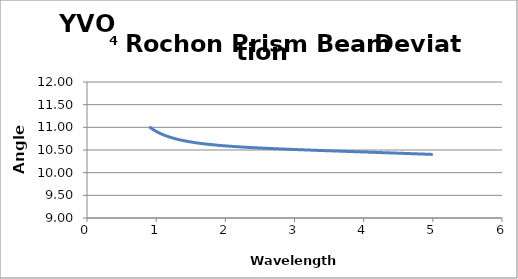
| Category | Series 0 |
|---|---|
| 0.9 | 11.012 |
| 0.901 | 11.011 |
| 0.902 | 11.01 |
| 0.903 | 11.008 |
| 0.904 | 11.007 |
| 0.905 | 11.006 |
| 0.906 | 11.005 |
| 0.907 | 11.004 |
| 0.908 | 11.003 |
| 0.909 | 11.001 |
| 0.91 | 11 |
| 0.911 | 10.999 |
| 0.912 | 10.998 |
| 0.913 | 10.997 |
| 0.914 | 10.996 |
| 0.915 | 10.995 |
| 0.916 | 10.994 |
| 0.917 | 10.992 |
| 0.918 | 10.991 |
| 0.919 | 10.99 |
| 0.92 | 10.989 |
| 0.921 | 10.988 |
| 0.922 | 10.987 |
| 0.923 | 10.986 |
| 0.924 | 10.985 |
| 0.925 | 10.984 |
| 0.926 | 10.982 |
| 0.927 | 10.981 |
| 0.928 | 10.98 |
| 0.929 | 10.979 |
| 0.93 | 10.978 |
| 0.931 | 10.977 |
| 0.932 | 10.976 |
| 0.933 | 10.975 |
| 0.934 | 10.974 |
| 0.935 | 10.973 |
| 0.936 | 10.972 |
| 0.937 | 10.971 |
| 0.938 | 10.97 |
| 0.939 | 10.969 |
| 0.94 | 10.968 |
| 0.941 | 10.967 |
| 0.942 | 10.966 |
| 0.943 | 10.965 |
| 0.944 | 10.964 |
| 0.945 | 10.963 |
| 0.946 | 10.962 |
| 0.947 | 10.961 |
| 0.948 | 10.96 |
| 0.949 | 10.959 |
| 0.95 | 10.958 |
| 0.951 | 10.957 |
| 0.952 | 10.956 |
| 0.953 | 10.955 |
| 0.954 | 10.954 |
| 0.955 | 10.953 |
| 0.956 | 10.952 |
| 0.957 | 10.951 |
| 0.958 | 10.95 |
| 0.959 | 10.949 |
| 0.96 | 10.948 |
| 0.961 | 10.947 |
| 0.962 | 10.946 |
| 0.963 | 10.945 |
| 0.964 | 10.944 |
| 0.965 | 10.943 |
| 0.966 | 10.942 |
| 0.967 | 10.941 |
| 0.968 | 10.94 |
| 0.969 | 10.939 |
| 0.97 | 10.938 |
| 0.971 | 10.937 |
| 0.972 | 10.936 |
| 0.973 | 10.935 |
| 0.974 | 10.935 |
| 0.975 | 10.934 |
| 0.976 | 10.933 |
| 0.977 | 10.932 |
| 0.978 | 10.931 |
| 0.979 | 10.93 |
| 0.98 | 10.929 |
| 0.981 | 10.928 |
| 0.982 | 10.927 |
| 0.983 | 10.926 |
| 0.984 | 10.925 |
| 0.985 | 10.925 |
| 0.986 | 10.924 |
| 0.987 | 10.923 |
| 0.988 | 10.922 |
| 0.989 | 10.921 |
| 0.99 | 10.92 |
| 0.991 | 10.919 |
| 0.992 | 10.918 |
| 0.993 | 10.918 |
| 0.994 | 10.917 |
| 0.995 | 10.916 |
| 0.996 | 10.915 |
| 0.997 | 10.914 |
| 0.998 | 10.913 |
| 0.999 | 10.912 |
| 1.0 | 10.912 |
| 1.001 | 10.911 |
| 1.002 | 10.91 |
| 1.003 | 10.909 |
| 1.004 | 10.908 |
| 1.005 | 10.907 |
| 1.006 | 10.907 |
| 1.007 | 10.906 |
| 1.008 | 10.905 |
| 1.009 | 10.904 |
| 1.01 | 10.903 |
| 1.011 | 10.902 |
| 1.012 | 10.902 |
| 1.013 | 10.901 |
| 1.014 | 10.9 |
| 1.015 | 10.899 |
| 1.016 | 10.898 |
| 1.017 | 10.897 |
| 1.018 | 10.897 |
| 1.019 | 10.896 |
| 1.02 | 10.895 |
| 1.021 | 10.894 |
| 1.022 | 10.893 |
| 1.023 | 10.893 |
| 1.024 | 10.892 |
| 1.025 | 10.891 |
| 1.026 | 10.89 |
| 1.027 | 10.89 |
| 1.028 | 10.889 |
| 1.029 | 10.888 |
| 1.03 | 10.887 |
| 1.031 | 10.886 |
| 1.032 | 10.886 |
| 1.033 | 10.885 |
| 1.034 | 10.884 |
| 1.035 | 10.883 |
| 1.036 | 10.883 |
| 1.037 | 10.882 |
| 1.038 | 10.881 |
| 1.039 | 10.88 |
| 1.04 | 10.88 |
| 1.041 | 10.879 |
| 1.042 | 10.878 |
| 1.043 | 10.877 |
| 1.044 | 10.877 |
| 1.045 | 10.876 |
| 1.046 | 10.875 |
| 1.047 | 10.874 |
| 1.048 | 10.874 |
| 1.049 | 10.873 |
| 1.05 | 10.872 |
| 1.051 | 10.871 |
| 1.052 | 10.871 |
| 1.053 | 10.87 |
| 1.054 | 10.869 |
| 1.055 | 10.869 |
| 1.056 | 10.868 |
| 1.057 | 10.867 |
| 1.058 | 10.866 |
| 1.059 | 10.866 |
| 1.06 | 10.865 |
| 1.061 | 10.864 |
| 1.062 | 10.864 |
| 1.063 | 10.863 |
| 1.064 | 10.862 |
| 1.065 | 10.861 |
| 1.066 | 10.861 |
| 1.067 | 10.86 |
| 1.068 | 10.859 |
| 1.069 | 10.859 |
| 1.07 | 10.858 |
| 1.071 | 10.857 |
| 1.072 | 10.857 |
| 1.073 | 10.856 |
| 1.074 | 10.855 |
| 1.075 | 10.855 |
| 1.076 | 10.854 |
| 1.077 | 10.853 |
| 1.078 | 10.853 |
| 1.079 | 10.852 |
| 1.08 | 10.851 |
| 1.081 | 10.851 |
| 1.082 | 10.85 |
| 1.083 | 10.849 |
| 1.084 | 10.849 |
| 1.085 | 10.848 |
| 1.086 | 10.847 |
| 1.087 | 10.847 |
| 1.088 | 10.846 |
| 1.089 | 10.845 |
| 1.09 | 10.845 |
| 1.091 | 10.844 |
| 1.092 | 10.843 |
| 1.093 | 10.843 |
| 1.094 | 10.842 |
| 1.095 | 10.841 |
| 1.096 | 10.841 |
| 1.097 | 10.84 |
| 1.098 | 10.839 |
| 1.099 | 10.839 |
| 1.1 | 10.838 |
| 1.101 | 10.838 |
| 1.102 | 10.837 |
| 1.103 | 10.836 |
| 1.104 | 10.836 |
| 1.105 | 10.835 |
| 1.106 | 10.834 |
| 1.107 | 10.834 |
| 1.108 | 10.833 |
| 1.109 | 10.833 |
| 1.11 | 10.832 |
| 1.111 | 10.831 |
| 1.112 | 10.831 |
| 1.113 | 10.83 |
| 1.114 | 10.83 |
| 1.115 | 10.829 |
| 1.116 | 10.828 |
| 1.117 | 10.828 |
| 1.118 | 10.827 |
| 1.119 | 10.826 |
| 1.12 | 10.826 |
| 1.121 | 10.825 |
| 1.122 | 10.825 |
| 1.123 | 10.824 |
| 1.124 | 10.823 |
| 1.125 | 10.823 |
| 1.126 | 10.822 |
| 1.127 | 10.822 |
| 1.128 | 10.821 |
| 1.129 | 10.821 |
| 1.13 | 10.82 |
| 1.131 | 10.819 |
| 1.132 | 10.819 |
| 1.133 | 10.818 |
| 1.134 | 10.818 |
| 1.135 | 10.817 |
| 1.136 | 10.816 |
| 1.137 | 10.816 |
| 1.138 | 10.815 |
| 1.139 | 10.815 |
| 1.14 | 10.814 |
| 1.141 | 10.814 |
| 1.142 | 10.813 |
| 1.143 | 10.813 |
| 1.144 | 10.812 |
| 1.145 | 10.811 |
| 1.146 | 10.811 |
| 1.147 | 10.81 |
| 1.148 | 10.81 |
| 1.149 | 10.809 |
| 1.15 | 10.809 |
| 1.151 | 10.808 |
| 1.152 | 10.808 |
| 1.153 | 10.807 |
| 1.154 | 10.806 |
| 1.155 | 10.806 |
| 1.156 | 10.805 |
| 1.157 | 10.805 |
| 1.158 | 10.804 |
| 1.159 | 10.804 |
| 1.16 | 10.803 |
| 1.161 | 10.803 |
| 1.162 | 10.802 |
| 1.163 | 10.802 |
| 1.164 | 10.801 |
| 1.165 | 10.8 |
| 1.166 | 10.8 |
| 1.167 | 10.799 |
| 1.168 | 10.799 |
| 1.169 | 10.798 |
| 1.17 | 10.798 |
| 1.171 | 10.797 |
| 1.172 | 10.797 |
| 1.173 | 10.796 |
| 1.174 | 10.796 |
| 1.175 | 10.795 |
| 1.176 | 10.795 |
| 1.177 | 10.794 |
| 1.178 | 10.794 |
| 1.179 | 10.793 |
| 1.18 | 10.793 |
| 1.181 | 10.792 |
| 1.182 | 10.792 |
| 1.183 | 10.791 |
| 1.184 | 10.791 |
| 1.185 | 10.79 |
| 1.186 | 10.79 |
| 1.187 | 10.789 |
| 1.188 | 10.789 |
| 1.189 | 10.788 |
| 1.19 | 10.788 |
| 1.191 | 10.787 |
| 1.192 | 10.787 |
| 1.193 | 10.786 |
| 1.194 | 10.786 |
| 1.195 | 10.785 |
| 1.196 | 10.785 |
| 1.197 | 10.784 |
| 1.198 | 10.784 |
| 1.199 | 10.783 |
| 1.2 | 10.783 |
| 1.201 | 10.782 |
| 1.202 | 10.782 |
| 1.203 | 10.781 |
| 1.204 | 10.781 |
| 1.205 | 10.78 |
| 1.206 | 10.78 |
| 1.207 | 10.779 |
| 1.208 | 10.779 |
| 1.209 | 10.778 |
| 1.21 | 10.778 |
| 1.211 | 10.777 |
| 1.212 | 10.777 |
| 1.213 | 10.776 |
| 1.214 | 10.776 |
| 1.215 | 10.776 |
| 1.216 | 10.775 |
| 1.217 | 10.775 |
| 1.218 | 10.774 |
| 1.219 | 10.774 |
| 1.22 | 10.773 |
| 1.221 | 10.773 |
| 1.222 | 10.772 |
| 1.223 | 10.772 |
| 1.224 | 10.771 |
| 1.225 | 10.771 |
| 1.226 | 10.77 |
| 1.227 | 10.77 |
| 1.228 | 10.77 |
| 1.229 | 10.769 |
| 1.23 | 10.769 |
| 1.231 | 10.768 |
| 1.232 | 10.768 |
| 1.233 | 10.767 |
| 1.234 | 10.767 |
| 1.235 | 10.766 |
| 1.236 | 10.766 |
| 1.237 | 10.766 |
| 1.238 | 10.765 |
| 1.239 | 10.765 |
| 1.24 | 10.764 |
| 1.241 | 10.764 |
| 1.242 | 10.763 |
| 1.243 | 10.763 |
| 1.244 | 10.762 |
| 1.245 | 10.762 |
| 1.246 | 10.762 |
| 1.247 | 10.761 |
| 1.248 | 10.761 |
| 1.249 | 10.76 |
| 1.25 | 10.76 |
| 1.251 | 10.759 |
| 1.252 | 10.759 |
| 1.253 | 10.759 |
| 1.254 | 10.758 |
| 1.255 | 10.758 |
| 1.256 | 10.757 |
| 1.257 | 10.757 |
| 1.258 | 10.756 |
| 1.259 | 10.756 |
| 1.26 | 10.756 |
| 1.261 | 10.755 |
| 1.262 | 10.755 |
| 1.263 | 10.754 |
| 1.264 | 10.754 |
| 1.265 | 10.754 |
| 1.266 | 10.753 |
| 1.267 | 10.753 |
| 1.268 | 10.752 |
| 1.269 | 10.752 |
| 1.27 | 10.751 |
| 1.271 | 10.751 |
| 1.272 | 10.751 |
| 1.273 | 10.75 |
| 1.274 | 10.75 |
| 1.275 | 10.749 |
| 1.276 | 10.749 |
| 1.277 | 10.749 |
| 1.278 | 10.748 |
| 1.279 | 10.748 |
| 1.28 | 10.747 |
| 1.281 | 10.747 |
| 1.282 | 10.747 |
| 1.283 | 10.746 |
| 1.284 | 10.746 |
| 1.285 | 10.745 |
| 1.286 | 10.745 |
| 1.287 | 10.745 |
| 1.288 | 10.744 |
| 1.289 | 10.744 |
| 1.29 | 10.743 |
| 1.291 | 10.743 |
| 1.292 | 10.743 |
| 1.293 | 10.742 |
| 1.294 | 10.742 |
| 1.295 | 10.742 |
| 1.296 | 10.741 |
| 1.297 | 10.741 |
| 1.298 | 10.74 |
| 1.299 | 10.74 |
| 1.3 | 10.74 |
| 1.301 | 10.739 |
| 1.302 | 10.739 |
| 1.303 | 10.738 |
| 1.304 | 10.738 |
| 1.305 | 10.738 |
| 1.306 | 10.737 |
| 1.307 | 10.737 |
| 1.308 | 10.737 |
| 1.309 | 10.736 |
| 1.31 | 10.736 |
| 1.311 | 10.735 |
| 1.312 | 10.735 |
| 1.313 | 10.735 |
| 1.314 | 10.734 |
| 1.315 | 10.734 |
| 1.316 | 10.734 |
| 1.317 | 10.733 |
| 1.318 | 10.733 |
| 1.319 | 10.732 |
| 1.32 | 10.732 |
| 1.321 | 10.732 |
| 1.322 | 10.731 |
| 1.323 | 10.731 |
| 1.324 | 10.731 |
| 1.325 | 10.73 |
| 1.326 | 10.73 |
| 1.327 | 10.73 |
| 1.328 | 10.729 |
| 1.329 | 10.729 |
| 1.33 | 10.728 |
| 1.331 | 10.728 |
| 1.332 | 10.728 |
| 1.333 | 10.727 |
| 1.334 | 10.727 |
| 1.335 | 10.727 |
| 1.336 | 10.726 |
| 1.337 | 10.726 |
| 1.338 | 10.726 |
| 1.339 | 10.725 |
| 1.34 | 10.725 |
| 1.341 | 10.725 |
| 1.342 | 10.724 |
| 1.343 | 10.724 |
| 1.344 | 10.724 |
| 1.345 | 10.723 |
| 1.346 | 10.723 |
| 1.347 | 10.723 |
| 1.348 | 10.722 |
| 1.349 | 10.722 |
| 1.35 | 10.721 |
| 1.351 | 10.721 |
| 1.352 | 10.721 |
| 1.353 | 10.72 |
| 1.354 | 10.72 |
| 1.355 | 10.72 |
| 1.356 | 10.719 |
| 1.357 | 10.719 |
| 1.358 | 10.719 |
| 1.359 | 10.718 |
| 1.36 | 10.718 |
| 1.361 | 10.718 |
| 1.362 | 10.717 |
| 1.363 | 10.717 |
| 1.364 | 10.717 |
| 1.365 | 10.716 |
| 1.366 | 10.716 |
| 1.367 | 10.716 |
| 1.368 | 10.715 |
| 1.369 | 10.715 |
| 1.37 | 10.715 |
| 1.371 | 10.714 |
| 1.372 | 10.714 |
| 1.373 | 10.714 |
| 1.374 | 10.713 |
| 1.375 | 10.713 |
| 1.376 | 10.713 |
| 1.377 | 10.712 |
| 1.378 | 10.712 |
| 1.379 | 10.712 |
| 1.38 | 10.712 |
| 1.381 | 10.711 |
| 1.382 | 10.711 |
| 1.383 | 10.711 |
| 1.384 | 10.71 |
| 1.385 | 10.71 |
| 1.386 | 10.71 |
| 1.387 | 10.709 |
| 1.388 | 10.709 |
| 1.389 | 10.709 |
| 1.39 | 10.708 |
| 1.391 | 10.708 |
| 1.392 | 10.708 |
| 1.393 | 10.707 |
| 1.394 | 10.707 |
| 1.395 | 10.707 |
| 1.396 | 10.706 |
| 1.397 | 10.706 |
| 1.398 | 10.706 |
| 1.399 | 10.706 |
| 1.4 | 10.705 |
| 1.401 | 10.705 |
| 1.402 | 10.705 |
| 1.403 | 10.704 |
| 1.404 | 10.704 |
| 1.405 | 10.704 |
| 1.406 | 10.703 |
| 1.407 | 10.703 |
| 1.408 | 10.703 |
| 1.409 | 10.702 |
| 1.41 | 10.702 |
| 1.411 | 10.702 |
| 1.412 | 10.702 |
| 1.413 | 10.701 |
| 1.414 | 10.701 |
| 1.415 | 10.701 |
| 1.416 | 10.7 |
| 1.417 | 10.7 |
| 1.418 | 10.7 |
| 1.419 | 10.7 |
| 1.42 | 10.699 |
| 1.421 | 10.699 |
| 1.422 | 10.699 |
| 1.423 | 10.698 |
| 1.424 | 10.698 |
| 1.425 | 10.698 |
| 1.426 | 10.697 |
| 1.427 | 10.697 |
| 1.428 | 10.697 |
| 1.429 | 10.697 |
| 1.43 | 10.696 |
| 1.431 | 10.696 |
| 1.432 | 10.696 |
| 1.433 | 10.695 |
| 1.434 | 10.695 |
| 1.435 | 10.695 |
| 1.436 | 10.695 |
| 1.437 | 10.694 |
| 1.438 | 10.694 |
| 1.439 | 10.694 |
| 1.44 | 10.693 |
| 1.441 | 10.693 |
| 1.442 | 10.693 |
| 1.443 | 10.693 |
| 1.444 | 10.692 |
| 1.445 | 10.692 |
| 1.446 | 10.692 |
| 1.447 | 10.691 |
| 1.448 | 10.691 |
| 1.449 | 10.691 |
| 1.45 | 10.691 |
| 1.451 | 10.69 |
| 1.452 | 10.69 |
| 1.453 | 10.69 |
| 1.454 | 10.689 |
| 1.455 | 10.689 |
| 1.456 | 10.689 |
| 1.457 | 10.689 |
| 1.458 | 10.688 |
| 1.459 | 10.688 |
| 1.46 | 10.688 |
| 1.461 | 10.688 |
| 1.462 | 10.687 |
| 1.463 | 10.687 |
| 1.464 | 10.687 |
| 1.465 | 10.686 |
| 1.466 | 10.686 |
| 1.467 | 10.686 |
| 1.468 | 10.686 |
| 1.469 | 10.685 |
| 1.47 | 10.685 |
| 1.471 | 10.685 |
| 1.472 | 10.685 |
| 1.473 | 10.684 |
| 1.474 | 10.684 |
| 1.475 | 10.684 |
| 1.476 | 10.684 |
| 1.477 | 10.683 |
| 1.478 | 10.683 |
| 1.479 | 10.683 |
| 1.48 | 10.682 |
| 1.481 | 10.682 |
| 1.482 | 10.682 |
| 1.483 | 10.682 |
| 1.484 | 10.681 |
| 1.485 | 10.681 |
| 1.486 | 10.681 |
| 1.487 | 10.681 |
| 1.488 | 10.68 |
| 1.489 | 10.68 |
| 1.49 | 10.68 |
| 1.491 | 10.68 |
| 1.492 | 10.679 |
| 1.493 | 10.679 |
| 1.494 | 10.679 |
| 1.495 | 10.679 |
| 1.496 | 10.678 |
| 1.497 | 10.678 |
| 1.498 | 10.678 |
| 1.499 | 10.678 |
| 1.5 | 10.677 |
| 1.501 | 10.677 |
| 1.502 | 10.677 |
| 1.503 | 10.677 |
| 1.504 | 10.676 |
| 1.505 | 10.676 |
| 1.506 | 10.676 |
| 1.507 | 10.676 |
| 1.508 | 10.675 |
| 1.509 | 10.675 |
| 1.51 | 10.675 |
| 1.511 | 10.675 |
| 1.512 | 10.674 |
| 1.513 | 10.674 |
| 1.514 | 10.674 |
| 1.515 | 10.674 |
| 1.516 | 10.673 |
| 1.517 | 10.673 |
| 1.518 | 10.673 |
| 1.519 | 10.673 |
| 1.52 | 10.672 |
| 1.521 | 10.672 |
| 1.522 | 10.672 |
| 1.523 | 10.672 |
| 1.524 | 10.671 |
| 1.525 | 10.671 |
| 1.526 | 10.671 |
| 1.527 | 10.671 |
| 1.528 | 10.67 |
| 1.529 | 10.67 |
| 1.53 | 10.67 |
| 1.531 | 10.67 |
| 1.532 | 10.669 |
| 1.533 | 10.669 |
| 1.534 | 10.669 |
| 1.535 | 10.669 |
| 1.536 | 10.669 |
| 1.537 | 10.668 |
| 1.538 | 10.668 |
| 1.539 | 10.668 |
| 1.54 | 10.668 |
| 1.541 | 10.667 |
| 1.542 | 10.667 |
| 1.543 | 10.667 |
| 1.544 | 10.667 |
| 1.545 | 10.666 |
| 1.546 | 10.666 |
| 1.547 | 10.666 |
| 1.548 | 10.666 |
| 1.549 | 10.665 |
| 1.55 | 10.665 |
| 1.551 | 10.665 |
| 1.552 | 10.665 |
| 1.553 | 10.665 |
| 1.554 | 10.664 |
| 1.555 | 10.664 |
| 1.556 | 10.664 |
| 1.557 | 10.664 |
| 1.558 | 10.663 |
| 1.559 | 10.663 |
| 1.56 | 10.663 |
| 1.561 | 10.663 |
| 1.562 | 10.663 |
| 1.563 | 10.662 |
| 1.564 | 10.662 |
| 1.565 | 10.662 |
| 1.566 | 10.662 |
| 1.567 | 10.661 |
| 1.568 | 10.661 |
| 1.569 | 10.661 |
| 1.57 | 10.661 |
| 1.571 | 10.66 |
| 1.572 | 10.66 |
| 1.573 | 10.66 |
| 1.574 | 10.66 |
| 1.575 | 10.66 |
| 1.576 | 10.659 |
| 1.577 | 10.659 |
| 1.578 | 10.659 |
| 1.579 | 10.659 |
| 1.58 | 10.659 |
| 1.581 | 10.658 |
| 1.582 | 10.658 |
| 1.583 | 10.658 |
| 1.584 | 10.658 |
| 1.585 | 10.657 |
| 1.586 | 10.657 |
| 1.587 | 10.657 |
| 1.588 | 10.657 |
| 1.589 | 10.657 |
| 1.59 | 10.656 |
| 1.591 | 10.656 |
| 1.592 | 10.656 |
| 1.593 | 10.656 |
| 1.594 | 10.655 |
| 1.595 | 10.655 |
| 1.596 | 10.655 |
| 1.597 | 10.655 |
| 1.598 | 10.655 |
| 1.599 | 10.654 |
| 1.6 | 10.654 |
| 1.601 | 10.654 |
| 1.602 | 10.654 |
| 1.603 | 10.654 |
| 1.604 | 10.653 |
| 1.605 | 10.653 |
| 1.606 | 10.653 |
| 1.607 | 10.653 |
| 1.608 | 10.653 |
| 1.609 | 10.652 |
| 1.61 | 10.652 |
| 1.611 | 10.652 |
| 1.612 | 10.652 |
| 1.613 | 10.651 |
| 1.614 | 10.651 |
| 1.615 | 10.651 |
| 1.616 | 10.651 |
| 1.617 | 10.651 |
| 1.618 | 10.65 |
| 1.619 | 10.65 |
| 1.62 | 10.65 |
| 1.621 | 10.65 |
| 1.622 | 10.65 |
| 1.623 | 10.649 |
| 1.624 | 10.649 |
| 1.625 | 10.649 |
| 1.626 | 10.649 |
| 1.627 | 10.649 |
| 1.628 | 10.648 |
| 1.629 | 10.648 |
| 1.63 | 10.648 |
| 1.631 | 10.648 |
| 1.632 | 10.648 |
| 1.633 | 10.647 |
| 1.634 | 10.647 |
| 1.635 | 10.647 |
| 1.636 | 10.647 |
| 1.637 | 10.647 |
| 1.638 | 10.646 |
| 1.639 | 10.646 |
| 1.64 | 10.646 |
| 1.641 | 10.646 |
| 1.642 | 10.646 |
| 1.643 | 10.645 |
| 1.644 | 10.645 |
| 1.645 | 10.645 |
| 1.646 | 10.645 |
| 1.647 | 10.645 |
| 1.648 | 10.644 |
| 1.649 | 10.644 |
| 1.65 | 10.644 |
| 1.651 | 10.644 |
| 1.652 | 10.644 |
| 1.653 | 10.643 |
| 1.654 | 10.643 |
| 1.655 | 10.643 |
| 1.656 | 10.643 |
| 1.657 | 10.643 |
| 1.658 | 10.643 |
| 1.659 | 10.642 |
| 1.66 | 10.642 |
| 1.661 | 10.642 |
| 1.662 | 10.642 |
| 1.663 | 10.642 |
| 1.664 | 10.641 |
| 1.665 | 10.641 |
| 1.666 | 10.641 |
| 1.667 | 10.641 |
| 1.668 | 10.641 |
| 1.669 | 10.64 |
| 1.67 | 10.64 |
| 1.671 | 10.64 |
| 1.672 | 10.64 |
| 1.673 | 10.64 |
| 1.674 | 10.64 |
| 1.675 | 10.639 |
| 1.676 | 10.639 |
| 1.677 | 10.639 |
| 1.678 | 10.639 |
| 1.679 | 10.639 |
| 1.68 | 10.638 |
| 1.681 | 10.638 |
| 1.682 | 10.638 |
| 1.683 | 10.638 |
| 1.684 | 10.638 |
| 1.685 | 10.637 |
| 1.686 | 10.637 |
| 1.687 | 10.637 |
| 1.688 | 10.637 |
| 1.689 | 10.637 |
| 1.69 | 10.637 |
| 1.691 | 10.636 |
| 1.692 | 10.636 |
| 1.693 | 10.636 |
| 1.694 | 10.636 |
| 1.695 | 10.636 |
| 1.696 | 10.635 |
| 1.697 | 10.635 |
| 1.698 | 10.635 |
| 1.699 | 10.635 |
| 1.7 | 10.635 |
| 1.701 | 10.635 |
| 1.702 | 10.634 |
| 1.703 | 10.634 |
| 1.704 | 10.634 |
| 1.705 | 10.634 |
| 1.706 | 10.634 |
| 1.707 | 10.634 |
| 1.708 | 10.633 |
| 1.709 | 10.633 |
| 1.71 | 10.633 |
| 1.711 | 10.633 |
| 1.712 | 10.633 |
| 1.713 | 10.632 |
| 1.714 | 10.632 |
| 1.715 | 10.632 |
| 1.716 | 10.632 |
| 1.717 | 10.632 |
| 1.718 | 10.632 |
| 1.719 | 10.631 |
| 1.72 | 10.631 |
| 1.721 | 10.631 |
| 1.722 | 10.631 |
| 1.723 | 10.631 |
| 1.724 | 10.631 |
| 1.725 | 10.63 |
| 1.726 | 10.63 |
| 1.727 | 10.63 |
| 1.728 | 10.63 |
| 1.729 | 10.63 |
| 1.73 | 10.629 |
| 1.731 | 10.629 |
| 1.732 | 10.629 |
| 1.733 | 10.629 |
| 1.734 | 10.629 |
| 1.735 | 10.629 |
| 1.736 | 10.628 |
| 1.737 | 10.628 |
| 1.738 | 10.628 |
| 1.739 | 10.628 |
| 1.74 | 10.628 |
| 1.741 | 10.628 |
| 1.742 | 10.627 |
| 1.743 | 10.627 |
| 1.744 | 10.627 |
| 1.745 | 10.627 |
| 1.746 | 10.627 |
| 1.747 | 10.627 |
| 1.748 | 10.626 |
| 1.749 | 10.626 |
| 1.75 | 10.626 |
| 1.751 | 10.626 |
| 1.752 | 10.626 |
| 1.753 | 10.626 |
| 1.754 | 10.625 |
| 1.755 | 10.625 |
| 1.756 | 10.625 |
| 1.757 | 10.625 |
| 1.758 | 10.625 |
| 1.759 | 10.625 |
| 1.76 | 10.624 |
| 1.761 | 10.624 |
| 1.762 | 10.624 |
| 1.763 | 10.624 |
| 1.764 | 10.624 |
| 1.765 | 10.624 |
| 1.766 | 10.623 |
| 1.767 | 10.623 |
| 1.768 | 10.623 |
| 1.769 | 10.623 |
| 1.77 | 10.623 |
| 1.771 | 10.623 |
| 1.772 | 10.623 |
| 1.773 | 10.622 |
| 1.774 | 10.622 |
| 1.775 | 10.622 |
| 1.776 | 10.622 |
| 1.777 | 10.622 |
| 1.778 | 10.622 |
| 1.779 | 10.621 |
| 1.78 | 10.621 |
| 1.781 | 10.621 |
| 1.782 | 10.621 |
| 1.783 | 10.621 |
| 1.784 | 10.621 |
| 1.785 | 10.62 |
| 1.786 | 10.62 |
| 1.787 | 10.62 |
| 1.788 | 10.62 |
| 1.789 | 10.62 |
| 1.79 | 10.62 |
| 1.791 | 10.62 |
| 1.792 | 10.619 |
| 1.793 | 10.619 |
| 1.794 | 10.619 |
| 1.795 | 10.619 |
| 1.796 | 10.619 |
| 1.797 | 10.619 |
| 1.798 | 10.618 |
| 1.799 | 10.618 |
| 1.8 | 10.618 |
| 1.801 | 10.618 |
| 1.802 | 10.618 |
| 1.803 | 10.618 |
| 1.804 | 10.617 |
| 1.805 | 10.617 |
| 1.806 | 10.617 |
| 1.807 | 10.617 |
| 1.808 | 10.617 |
| 1.809 | 10.617 |
| 1.81 | 10.617 |
| 1.811 | 10.616 |
| 1.812 | 10.616 |
| 1.813 | 10.616 |
| 1.814 | 10.616 |
| 1.815 | 10.616 |
| 1.816 | 10.616 |
| 1.817 | 10.616 |
| 1.818 | 10.615 |
| 1.819 | 10.615 |
| 1.82 | 10.615 |
| 1.821 | 10.615 |
| 1.822 | 10.615 |
| 1.823 | 10.615 |
| 1.824 | 10.614 |
| 1.825 | 10.614 |
| 1.826 | 10.614 |
| 1.827 | 10.614 |
| 1.828 | 10.614 |
| 1.829 | 10.614 |
| 1.83 | 10.614 |
| 1.831 | 10.613 |
| 1.832 | 10.613 |
| 1.833 | 10.613 |
| 1.834 | 10.613 |
| 1.835 | 10.613 |
| 1.836 | 10.613 |
| 1.837 | 10.613 |
| 1.838 | 10.612 |
| 1.839 | 10.612 |
| 1.84 | 10.612 |
| 1.841 | 10.612 |
| 1.842 | 10.612 |
| 1.843 | 10.612 |
| 1.844 | 10.612 |
| 1.845 | 10.611 |
| 1.846 | 10.611 |
| 1.847 | 10.611 |
| 1.848 | 10.611 |
| 1.849 | 10.611 |
| 1.85 | 10.611 |
| 1.851 | 10.61 |
| 1.852 | 10.61 |
| 1.853 | 10.61 |
| 1.854 | 10.61 |
| 1.855 | 10.61 |
| 1.856 | 10.61 |
| 1.857 | 10.61 |
| 1.858 | 10.61 |
| 1.859 | 10.609 |
| 1.86 | 10.609 |
| 1.861 | 10.609 |
| 1.862 | 10.609 |
| 1.863 | 10.609 |
| 1.864 | 10.609 |
| 1.865 | 10.609 |
| 1.866 | 10.608 |
| 1.867 | 10.608 |
| 1.868 | 10.608 |
| 1.869 | 10.608 |
| 1.87 | 10.608 |
| 1.871 | 10.608 |
| 1.872 | 10.608 |
| 1.873 | 10.607 |
| 1.874 | 10.607 |
| 1.875 | 10.607 |
| 1.876 | 10.607 |
| 1.877 | 10.607 |
| 1.878 | 10.607 |
| 1.879 | 10.607 |
| 1.88 | 10.606 |
| 1.881 | 10.606 |
| 1.882 | 10.606 |
| 1.883 | 10.606 |
| 1.884 | 10.606 |
| 1.885 | 10.606 |
| 1.886 | 10.606 |
| 1.887 | 10.605 |
| 1.888 | 10.605 |
| 1.889 | 10.605 |
| 1.89 | 10.605 |
| 1.891 | 10.605 |
| 1.892 | 10.605 |
| 1.893 | 10.605 |
| 1.894 | 10.604 |
| 1.895 | 10.604 |
| 1.896 | 10.604 |
| 1.897 | 10.604 |
| 1.898 | 10.604 |
| 1.899 | 10.604 |
| 1.9 | 10.604 |
| 1.901 | 10.604 |
| 1.902 | 10.603 |
| 1.903 | 10.603 |
| 1.904 | 10.603 |
| 1.905 | 10.603 |
| 1.906 | 10.603 |
| 1.907 | 10.603 |
| 1.908 | 10.603 |
| 1.909 | 10.602 |
| 1.91 | 10.602 |
| 1.911 | 10.602 |
| 1.912 | 10.602 |
| 1.913 | 10.602 |
| 1.914 | 10.602 |
| 1.915 | 10.602 |
| 1.916 | 10.602 |
| 1.917 | 10.601 |
| 1.918 | 10.601 |
| 1.919 | 10.601 |
| 1.92 | 10.601 |
| 1.921 | 10.601 |
| 1.922 | 10.601 |
| 1.923 | 10.601 |
| 1.924 | 10.6 |
| 1.925 | 10.6 |
| 1.926 | 10.6 |
| 1.927 | 10.6 |
| 1.928 | 10.6 |
| 1.929 | 10.6 |
| 1.93 | 10.6 |
| 1.931 | 10.6 |
| 1.932 | 10.599 |
| 1.933 | 10.599 |
| 1.934 | 10.599 |
| 1.935 | 10.599 |
| 1.936 | 10.599 |
| 1.937 | 10.599 |
| 1.938 | 10.599 |
| 1.939 | 10.599 |
| 1.94 | 10.598 |
| 1.941 | 10.598 |
| 1.942 | 10.598 |
| 1.943 | 10.598 |
| 1.944 | 10.598 |
| 1.945 | 10.598 |
| 1.946 | 10.598 |
| 1.947 | 10.598 |
| 1.948 | 10.597 |
| 1.949 | 10.597 |
| 1.95 | 10.597 |
| 1.951 | 10.597 |
| 1.952 | 10.597 |
| 1.953 | 10.597 |
| 1.954 | 10.597 |
| 1.955 | 10.597 |
| 1.956 | 10.596 |
| 1.957 | 10.596 |
| 1.958 | 10.596 |
| 1.959 | 10.596 |
| 1.96 | 10.596 |
| 1.961 | 10.596 |
| 1.962 | 10.596 |
| 1.963 | 10.596 |
| 1.964 | 10.595 |
| 1.965 | 10.595 |
| 1.966 | 10.595 |
| 1.967 | 10.595 |
| 1.968 | 10.595 |
| 1.969 | 10.595 |
| 1.97 | 10.595 |
| 1.971 | 10.595 |
| 1.972 | 10.594 |
| 1.973 | 10.594 |
| 1.974 | 10.594 |
| 1.975 | 10.594 |
| 1.976 | 10.594 |
| 1.977 | 10.594 |
| 1.978 | 10.594 |
| 1.979 | 10.594 |
| 1.98 | 10.593 |
| 1.981 | 10.593 |
| 1.982 | 10.593 |
| 1.983 | 10.593 |
| 1.984 | 10.593 |
| 1.985 | 10.593 |
| 1.986 | 10.593 |
| 1.987 | 10.593 |
| 1.988 | 10.592 |
| 1.989 | 10.592 |
| 1.99 | 10.592 |
| 1.991 | 10.592 |
| 1.992 | 10.592 |
| 1.993 | 10.592 |
| 1.994 | 10.592 |
| 1.995 | 10.592 |
| 1.996 | 10.591 |
| 1.997 | 10.591 |
| 1.998 | 10.591 |
| 1.999 | 10.591 |
| 2.0 | 10.591 |
| 2.001 | 10.591 |
| 2.002 | 10.591 |
| 2.003 | 10.591 |
| 2.004 | 10.591 |
| 2.005 | 10.59 |
| 2.006 | 10.59 |
| 2.007 | 10.59 |
| 2.008 | 10.59 |
| 2.009 | 10.59 |
| 2.01 | 10.59 |
| 2.011 | 10.59 |
| 2.012 | 10.59 |
| 2.013 | 10.589 |
| 2.014 | 10.589 |
| 2.015 | 10.589 |
| 2.016 | 10.589 |
| 2.017 | 10.589 |
| 2.018 | 10.589 |
| 2.019 | 10.589 |
| 2.02 | 10.589 |
| 2.021 | 10.589 |
| 2.022 | 10.588 |
| 2.023 | 10.588 |
| 2.024 | 10.588 |
| 2.025 | 10.588 |
| 2.026 | 10.588 |
| 2.027 | 10.588 |
| 2.028 | 10.588 |
| 2.029 | 10.588 |
| 2.03 | 10.588 |
| 2.031 | 10.587 |
| 2.032 | 10.587 |
| 2.033 | 10.587 |
| 2.034 | 10.587 |
| 2.035 | 10.587 |
| 2.036 | 10.587 |
| 2.037 | 10.587 |
| 2.038 | 10.587 |
| 2.039 | 10.586 |
| 2.04 | 10.586 |
| 2.041 | 10.586 |
| 2.042 | 10.586 |
| 2.043 | 10.586 |
| 2.044 | 10.586 |
| 2.045 | 10.586 |
| 2.046 | 10.586 |
| 2.047 | 10.586 |
| 2.048 | 10.585 |
| 2.049 | 10.585 |
| 2.05 | 10.585 |
| 2.051 | 10.585 |
| 2.052 | 10.585 |
| 2.053 | 10.585 |
| 2.054 | 10.585 |
| 2.055 | 10.585 |
| 2.056 | 10.585 |
| 2.057 | 10.584 |
| 2.058 | 10.584 |
| 2.059 | 10.584 |
| 2.06 | 10.584 |
| 2.061 | 10.584 |
| 2.062 | 10.584 |
| 2.063 | 10.584 |
| 2.064 | 10.584 |
| 2.065 | 10.584 |
| 2.066 | 10.583 |
| 2.067 | 10.583 |
| 2.068 | 10.583 |
| 2.069 | 10.583 |
| 2.07 | 10.583 |
| 2.071 | 10.583 |
| 2.072 | 10.583 |
| 2.073 | 10.583 |
| 2.074 | 10.583 |
| 2.075 | 10.582 |
| 2.076 | 10.582 |
| 2.077 | 10.582 |
| 2.078 | 10.582 |
| 2.079 | 10.582 |
| 2.08 | 10.582 |
| 2.081 | 10.582 |
| 2.082 | 10.582 |
| 2.083 | 10.582 |
| 2.084 | 10.581 |
| 2.085 | 10.581 |
| 2.086 | 10.581 |
| 2.087 | 10.581 |
| 2.088 | 10.581 |
| 2.089 | 10.581 |
| 2.09 | 10.581 |
| 2.091 | 10.581 |
| 2.092 | 10.581 |
| 2.093 | 10.58 |
| 2.094 | 10.58 |
| 2.095 | 10.58 |
| 2.096 | 10.58 |
| 2.097 | 10.58 |
| 2.098 | 10.58 |
| 2.099 | 10.58 |
| 2.1 | 10.58 |
| 2.101 | 10.58 |
| 2.102 | 10.58 |
| 2.103 | 10.579 |
| 2.104 | 10.579 |
| 2.105 | 10.579 |
| 2.106 | 10.579 |
| 2.107 | 10.579 |
| 2.108 | 10.579 |
| 2.109 | 10.579 |
| 2.11 | 10.579 |
| 2.111 | 10.579 |
| 2.112 | 10.578 |
| 2.113 | 10.578 |
| 2.114 | 10.578 |
| 2.115 | 10.578 |
| 2.116 | 10.578 |
| 2.117 | 10.578 |
| 2.118 | 10.578 |
| 2.119 | 10.578 |
| 2.12 | 10.578 |
| 2.121 | 10.578 |
| 2.122 | 10.577 |
| 2.123 | 10.577 |
| 2.124 | 10.577 |
| 2.125 | 10.577 |
| 2.126 | 10.577 |
| 2.127 | 10.577 |
| 2.128 | 10.577 |
| 2.129 | 10.577 |
| 2.13 | 10.577 |
| 2.131 | 10.576 |
| 2.132 | 10.576 |
| 2.133 | 10.576 |
| 2.134 | 10.576 |
| 2.135 | 10.576 |
| 2.136 | 10.576 |
| 2.137 | 10.576 |
| 2.138 | 10.576 |
| 2.139 | 10.576 |
| 2.14 | 10.576 |
| 2.141 | 10.575 |
| 2.142 | 10.575 |
| 2.143 | 10.575 |
| 2.144 | 10.575 |
| 2.145 | 10.575 |
| 2.146 | 10.575 |
| 2.147 | 10.575 |
| 2.148 | 10.575 |
| 2.149 | 10.575 |
| 2.15 | 10.575 |
| 2.151 | 10.574 |
| 2.152 | 10.574 |
| 2.153 | 10.574 |
| 2.154 | 10.574 |
| 2.155 | 10.574 |
| 2.156 | 10.574 |
| 2.157 | 10.574 |
| 2.158 | 10.574 |
| 2.159 | 10.574 |
| 2.16 | 10.574 |
| 2.161 | 10.573 |
| 2.162 | 10.573 |
| 2.163 | 10.573 |
| 2.164 | 10.573 |
| 2.165 | 10.573 |
| 2.166 | 10.573 |
| 2.167 | 10.573 |
| 2.168 | 10.573 |
| 2.169 | 10.573 |
| 2.17 | 10.573 |
| 2.171 | 10.572 |
| 2.172 | 10.572 |
| 2.173 | 10.572 |
| 2.174 | 10.572 |
| 2.175 | 10.572 |
| 2.176 | 10.572 |
| 2.177 | 10.572 |
| 2.178 | 10.572 |
| 2.179 | 10.572 |
| 2.18 | 10.572 |
| 2.181 | 10.571 |
| 2.182 | 10.571 |
| 2.183 | 10.571 |
| 2.184 | 10.571 |
| 2.185 | 10.571 |
| 2.186 | 10.571 |
| 2.187 | 10.571 |
| 2.188 | 10.571 |
| 2.189 | 10.571 |
| 2.19 | 10.571 |
| 2.191 | 10.57 |
| 2.192 | 10.57 |
| 2.193 | 10.57 |
| 2.194 | 10.57 |
| 2.195 | 10.57 |
| 2.196 | 10.57 |
| 2.197 | 10.57 |
| 2.198 | 10.57 |
| 2.199 | 10.57 |
| 2.2 | 10.57 |
| 2.201 | 10.57 |
| 2.202 | 10.569 |
| 2.203 | 10.569 |
| 2.204 | 10.569 |
| 2.205 | 10.569 |
| 2.206 | 10.569 |
| 2.207 | 10.569 |
| 2.208 | 10.569 |
| 2.209 | 10.569 |
| 2.21 | 10.569 |
| 2.211 | 10.569 |
| 2.212 | 10.568 |
| 2.213 | 10.568 |
| 2.214 | 10.568 |
| 2.215 | 10.568 |
| 2.216 | 10.568 |
| 2.217 | 10.568 |
| 2.218 | 10.568 |
| 2.219 | 10.568 |
| 2.22 | 10.568 |
| 2.221 | 10.568 |
| 2.222 | 10.568 |
| 2.223 | 10.567 |
| 2.224 | 10.567 |
| 2.225 | 10.567 |
| 2.226 | 10.567 |
| 2.227 | 10.567 |
| 2.228 | 10.567 |
| 2.229 | 10.567 |
| 2.23 | 10.567 |
| 2.231 | 10.567 |
| 2.232 | 10.567 |
| 2.233 | 10.566 |
| 2.234 | 10.566 |
| 2.235 | 10.566 |
| 2.236 | 10.566 |
| 2.237 | 10.566 |
| 2.238 | 10.566 |
| 2.239 | 10.566 |
| 2.24 | 10.566 |
| 2.241 | 10.566 |
| 2.242 | 10.566 |
| 2.243 | 10.566 |
| 2.244 | 10.565 |
| 2.245 | 10.565 |
| 2.246 | 10.565 |
| 2.247 | 10.565 |
| 2.248 | 10.565 |
| 2.249 | 10.565 |
| 2.25 | 10.565 |
| 2.251 | 10.565 |
| 2.252 | 10.565 |
| 2.253 | 10.565 |
| 2.254 | 10.565 |
| 2.255 | 10.564 |
| 2.256 | 10.564 |
| 2.257 | 10.564 |
| 2.258 | 10.564 |
| 2.259 | 10.564 |
| 2.26 | 10.564 |
| 2.261 | 10.564 |
| 2.262 | 10.564 |
| 2.263 | 10.564 |
| 2.264 | 10.564 |
| 2.265 | 10.564 |
| 2.266 | 10.563 |
| 2.267 | 10.563 |
| 2.268 | 10.563 |
| 2.269 | 10.563 |
| 2.27 | 10.563 |
| 2.271 | 10.563 |
| 2.272 | 10.563 |
| 2.273 | 10.563 |
| 2.274 | 10.563 |
| 2.275 | 10.563 |
| 2.276 | 10.563 |
| 2.277 | 10.562 |
| 2.278 | 10.562 |
| 2.279 | 10.562 |
| 2.28 | 10.562 |
| 2.281 | 10.562 |
| 2.282 | 10.562 |
| 2.283 | 10.562 |
| 2.284 | 10.562 |
| 2.285 | 10.562 |
| 2.286 | 10.562 |
| 2.287 | 10.562 |
| 2.288 | 10.561 |
| 2.289 | 10.561 |
| 2.29 | 10.561 |
| 2.291 | 10.561 |
| 2.292 | 10.561 |
| 2.293 | 10.561 |
| 2.294 | 10.561 |
| 2.295 | 10.561 |
| 2.296 | 10.561 |
| 2.297 | 10.561 |
| 2.298 | 10.561 |
| 2.299 | 10.56 |
| 2.3 | 10.56 |
| 2.301 | 10.56 |
| 2.302 | 10.56 |
| 2.303 | 10.56 |
| 2.304 | 10.56 |
| 2.305 | 10.56 |
| 2.306 | 10.56 |
| 2.307 | 10.56 |
| 2.308 | 10.56 |
| 2.309 | 10.56 |
| 2.31 | 10.56 |
| 2.311 | 10.559 |
| 2.312 | 10.559 |
| 2.313 | 10.559 |
| 2.314 | 10.559 |
| 2.315 | 10.559 |
| 2.316 | 10.559 |
| 2.317 | 10.559 |
| 2.318 | 10.559 |
| 2.319 | 10.559 |
| 2.32 | 10.559 |
| 2.321 | 10.559 |
| 2.322 | 10.558 |
| 2.323 | 10.558 |
| 2.324 | 10.558 |
| 2.325 | 10.558 |
| 2.326 | 10.558 |
| 2.327 | 10.558 |
| 2.328 | 10.558 |
| 2.329 | 10.558 |
| 2.33 | 10.558 |
| 2.331 | 10.558 |
| 2.332 | 10.558 |
| 2.333 | 10.558 |
| 2.334 | 10.557 |
| 2.335 | 10.557 |
| 2.336 | 10.557 |
| 2.337 | 10.557 |
| 2.338 | 10.557 |
| 2.339 | 10.557 |
| 2.34 | 10.557 |
| 2.341 | 10.557 |
| 2.342 | 10.557 |
| 2.343 | 10.557 |
| 2.344 | 10.557 |
| 2.345 | 10.557 |
| 2.346 | 10.556 |
| 2.347 | 10.556 |
| 2.348 | 10.556 |
| 2.349 | 10.556 |
| 2.35 | 10.556 |
| 2.351 | 10.556 |
| 2.352 | 10.556 |
| 2.353 | 10.556 |
| 2.354 | 10.556 |
| 2.355 | 10.556 |
| 2.356 | 10.556 |
| 2.357 | 10.555 |
| 2.358 | 10.555 |
| 2.359 | 10.555 |
| 2.36 | 10.555 |
| 2.361 | 10.555 |
| 2.362 | 10.555 |
| 2.363 | 10.555 |
| 2.364 | 10.555 |
| 2.365 | 10.555 |
| 2.366 | 10.555 |
| 2.367 | 10.555 |
| 2.368 | 10.555 |
| 2.369 | 10.554 |
| 2.37 | 10.554 |
| 2.371 | 10.554 |
| 2.372 | 10.554 |
| 2.373 | 10.554 |
| 2.374 | 10.554 |
| 2.375 | 10.554 |
| 2.376 | 10.554 |
| 2.377 | 10.554 |
| 2.378 | 10.554 |
| 2.379 | 10.554 |
| 2.38 | 10.554 |
| 2.381 | 10.554 |
| 2.382 | 10.553 |
| 2.383 | 10.553 |
| 2.384 | 10.553 |
| 2.385 | 10.553 |
| 2.386 | 10.553 |
| 2.387 | 10.553 |
| 2.388 | 10.553 |
| 2.389 | 10.553 |
| 2.39 | 10.553 |
| 2.391 | 10.553 |
| 2.392 | 10.553 |
| 2.393 | 10.553 |
| 2.394 | 10.552 |
| 2.395 | 10.552 |
| 2.396 | 10.552 |
| 2.397 | 10.552 |
| 2.398 | 10.552 |
| 2.399 | 10.552 |
| 2.4 | 10.552 |
| 2.401 | 10.552 |
| 2.402 | 10.552 |
| 2.403 | 10.552 |
| 2.404 | 10.552 |
| 2.405 | 10.552 |
| 2.406 | 10.551 |
| 2.407 | 10.551 |
| 2.408 | 10.551 |
| 2.409 | 10.551 |
| 2.41 | 10.551 |
| 2.411 | 10.551 |
| 2.412 | 10.551 |
| 2.413 | 10.551 |
| 2.414 | 10.551 |
| 2.415 | 10.551 |
| 2.416 | 10.551 |
| 2.417 | 10.551 |
| 2.418 | 10.55 |
| 2.419 | 10.55 |
| 2.42 | 10.55 |
| 2.421 | 10.55 |
| 2.422 | 10.55 |
| 2.423 | 10.55 |
| 2.424 | 10.55 |
| 2.425 | 10.55 |
| 2.426 | 10.55 |
| 2.427 | 10.55 |
| 2.428 | 10.55 |
| 2.429 | 10.55 |
| 2.43 | 10.55 |
| 2.431 | 10.549 |
| 2.432 | 10.549 |
| 2.433 | 10.549 |
| 2.434 | 10.549 |
| 2.435 | 10.549 |
| 2.436 | 10.549 |
| 2.437 | 10.549 |
| 2.438 | 10.549 |
| 2.439 | 10.549 |
| 2.44 | 10.549 |
| 2.441 | 10.549 |
| 2.442 | 10.549 |
| 2.443 | 10.548 |
| 2.444 | 10.548 |
| 2.445 | 10.548 |
| 2.446 | 10.548 |
| 2.447 | 10.548 |
| 2.448 | 10.548 |
| 2.449 | 10.548 |
| 2.45 | 10.548 |
| 2.451 | 10.548 |
| 2.452 | 10.548 |
| 2.453 | 10.548 |
| 2.454 | 10.548 |
| 2.455 | 10.548 |
| 2.456 | 10.547 |
| 2.457 | 10.547 |
| 2.458 | 10.547 |
| 2.459 | 10.547 |
| 2.46 | 10.547 |
| 2.461 | 10.547 |
| 2.462 | 10.547 |
| 2.463 | 10.547 |
| 2.464 | 10.547 |
| 2.465 | 10.547 |
| 2.466 | 10.547 |
| 2.467 | 10.547 |
| 2.468 | 10.547 |
| 2.469 | 10.546 |
| 2.47 | 10.546 |
| 2.471 | 10.546 |
| 2.472 | 10.546 |
| 2.473 | 10.546 |
| 2.474 | 10.546 |
| 2.475 | 10.546 |
| 2.476 | 10.546 |
| 2.477 | 10.546 |
| 2.478 | 10.546 |
| 2.479 | 10.546 |
| 2.48 | 10.546 |
| 2.481 | 10.546 |
| 2.482 | 10.545 |
| 2.483 | 10.545 |
| 2.484 | 10.545 |
| 2.485 | 10.545 |
| 2.486 | 10.545 |
| 2.487 | 10.545 |
| 2.488 | 10.545 |
| 2.489 | 10.545 |
| 2.49 | 10.545 |
| 2.491 | 10.545 |
| 2.492 | 10.545 |
| 2.493 | 10.545 |
| 2.494 | 10.545 |
| 2.495 | 10.544 |
| 2.496 | 10.544 |
| 2.497 | 10.544 |
| 2.498 | 10.544 |
| 2.499 | 10.544 |
| 2.5 | 10.544 |
| 2.501 | 10.544 |
| 2.502 | 10.544 |
| 2.503 | 10.544 |
| 2.504 | 10.544 |
| 2.505 | 10.544 |
| 2.506 | 10.544 |
| 2.507 | 10.544 |
| 2.508 | 10.543 |
| 2.509 | 10.543 |
| 2.51 | 10.543 |
| 2.511 | 10.543 |
| 2.512 | 10.543 |
| 2.513 | 10.543 |
| 2.514 | 10.543 |
| 2.515 | 10.543 |
| 2.516 | 10.543 |
| 2.517 | 10.543 |
| 2.518 | 10.543 |
| 2.519 | 10.543 |
| 2.52 | 10.543 |
| 2.521 | 10.543 |
| 2.522 | 10.542 |
| 2.523 | 10.542 |
| 2.524 | 10.542 |
| 2.525 | 10.542 |
| 2.526 | 10.542 |
| 2.527 | 10.542 |
| 2.528 | 10.542 |
| 2.529 | 10.542 |
| 2.53 | 10.542 |
| 2.531 | 10.542 |
| 2.532 | 10.542 |
| 2.533 | 10.542 |
| 2.534 | 10.542 |
| 2.535 | 10.541 |
| 2.536 | 10.541 |
| 2.537 | 10.541 |
| 2.538 | 10.541 |
| 2.539 | 10.541 |
| 2.54 | 10.541 |
| 2.541 | 10.541 |
| 2.542 | 10.541 |
| 2.543 | 10.541 |
| 2.544 | 10.541 |
| 2.545 | 10.541 |
| 2.546 | 10.541 |
| 2.547 | 10.541 |
| 2.548 | 10.541 |
| 2.549 | 10.54 |
| 2.55 | 10.54 |
| 2.551 | 10.54 |
| 2.552 | 10.54 |
| 2.553 | 10.54 |
| 2.554 | 10.54 |
| 2.555 | 10.54 |
| 2.556 | 10.54 |
| 2.557 | 10.54 |
| 2.558 | 10.54 |
| 2.559 | 10.54 |
| 2.56 | 10.54 |
| 2.561 | 10.54 |
| 2.562 | 10.539 |
| 2.563 | 10.539 |
| 2.564 | 10.539 |
| 2.565 | 10.539 |
| 2.566 | 10.539 |
| 2.567 | 10.539 |
| 2.568 | 10.539 |
| 2.569 | 10.539 |
| 2.57 | 10.539 |
| 2.571 | 10.539 |
| 2.572 | 10.539 |
| 2.573 | 10.539 |
| 2.574 | 10.539 |
| 2.575 | 10.539 |
| 2.576 | 10.538 |
| 2.577 | 10.538 |
| 2.578 | 10.538 |
| 2.579 | 10.538 |
| 2.58 | 10.538 |
| 2.581 | 10.538 |
| 2.582 | 10.538 |
| 2.583 | 10.538 |
| 2.584 | 10.538 |
| 2.585 | 10.538 |
| 2.586 | 10.538 |
| 2.587 | 10.538 |
| 2.588 | 10.538 |
| 2.589 | 10.538 |
| 2.59 | 10.537 |
| 2.591 | 10.537 |
| 2.592 | 10.537 |
| 2.593 | 10.537 |
| 2.594 | 10.537 |
| 2.595 | 10.537 |
| 2.596 | 10.537 |
| 2.597 | 10.537 |
| 2.598 | 10.537 |
| 2.599 | 10.537 |
| 2.6 | 10.537 |
| 2.601 | 10.537 |
| 2.602 | 10.537 |
| 2.603 | 10.537 |
| 2.604 | 10.536 |
| 2.605 | 10.536 |
| 2.606 | 10.536 |
| 2.607 | 10.536 |
| 2.608 | 10.536 |
| 2.609 | 10.536 |
| 2.61 | 10.536 |
| 2.611 | 10.536 |
| 2.612 | 10.536 |
| 2.613 | 10.536 |
| 2.614 | 10.536 |
| 2.615 | 10.536 |
| 2.616 | 10.536 |
| 2.617 | 10.536 |
| 2.618 | 10.535 |
| 2.619 | 10.535 |
| 2.62 | 10.535 |
| 2.621 | 10.535 |
| 2.622 | 10.535 |
| 2.623 | 10.535 |
| 2.624 | 10.535 |
| 2.625 | 10.535 |
| 2.626 | 10.535 |
| 2.627 | 10.535 |
| 2.628 | 10.535 |
| 2.629 | 10.535 |
| 2.63 | 10.535 |
| 2.631 | 10.535 |
| 2.632 | 10.534 |
| 2.633 | 10.534 |
| 2.634 | 10.534 |
| 2.635 | 10.534 |
| 2.636 | 10.534 |
| 2.637 | 10.534 |
| 2.638 | 10.534 |
| 2.639 | 10.534 |
| 2.64 | 10.534 |
| 2.641 | 10.534 |
| 2.642 | 10.534 |
| 2.643 | 10.534 |
| 2.644 | 10.534 |
| 2.645 | 10.534 |
| 2.646 | 10.534 |
| 2.647 | 10.533 |
| 2.648 | 10.533 |
| 2.649 | 10.533 |
| 2.65 | 10.533 |
| 2.651 | 10.533 |
| 2.652 | 10.533 |
| 2.653 | 10.533 |
| 2.654 | 10.533 |
| 2.655 | 10.533 |
| 2.656 | 10.533 |
| 2.657 | 10.533 |
| 2.658 | 10.533 |
| 2.659 | 10.533 |
| 2.66 | 10.533 |
| 2.661 | 10.532 |
| 2.662 | 10.532 |
| 2.663 | 10.532 |
| 2.664 | 10.532 |
| 2.665 | 10.532 |
| 2.666 | 10.532 |
| 2.667 | 10.532 |
| 2.668 | 10.532 |
| 2.669 | 10.532 |
| 2.67 | 10.532 |
| 2.671 | 10.532 |
| 2.672 | 10.532 |
| 2.673 | 10.532 |
| 2.674 | 10.532 |
| 2.675 | 10.532 |
| 2.676 | 10.531 |
| 2.677 | 10.531 |
| 2.678 | 10.531 |
| 2.679 | 10.531 |
| 2.68 | 10.531 |
| 2.681 | 10.531 |
| 2.682 | 10.531 |
| 2.683 | 10.531 |
| 2.684 | 10.531 |
| 2.685 | 10.531 |
| 2.686 | 10.531 |
| 2.687 | 10.531 |
| 2.688 | 10.531 |
| 2.689 | 10.531 |
| 2.69 | 10.531 |
| 2.691 | 10.53 |
| 2.692 | 10.53 |
| 2.693 | 10.53 |
| 2.694 | 10.53 |
| 2.695 | 10.53 |
| 2.696 | 10.53 |
| 2.697 | 10.53 |
| 2.698 | 10.53 |
| 2.699 | 10.53 |
| 2.7 | 10.53 |
| 2.701 | 10.53 |
| 2.702 | 10.53 |
| 2.703 | 10.53 |
| 2.704 | 10.53 |
| 2.705 | 10.53 |
| 2.706 | 10.529 |
| 2.707 | 10.529 |
| 2.708 | 10.529 |
| 2.709 | 10.529 |
| 2.71 | 10.529 |
| 2.711 | 10.529 |
| 2.712 | 10.529 |
| 2.713 | 10.529 |
| 2.714 | 10.529 |
| 2.715 | 10.529 |
| 2.716 | 10.529 |
| 2.717 | 10.529 |
| 2.718 | 10.529 |
| 2.719 | 10.529 |
| 2.72 | 10.528 |
| 2.721 | 10.528 |
| 2.722 | 10.528 |
| 2.723 | 10.528 |
| 2.724 | 10.528 |
| 2.725 | 10.528 |
| 2.726 | 10.528 |
| 2.727 | 10.528 |
| 2.728 | 10.528 |
| 2.729 | 10.528 |
| 2.73 | 10.528 |
| 2.731 | 10.528 |
| 2.732 | 10.528 |
| 2.733 | 10.528 |
| 2.734 | 10.528 |
| 2.735 | 10.528 |
| 2.736 | 10.527 |
| 2.737 | 10.527 |
| 2.738 | 10.527 |
| 2.739 | 10.527 |
| 2.74 | 10.527 |
| 2.741 | 10.527 |
| 2.742 | 10.527 |
| 2.743 | 10.527 |
| 2.744 | 10.527 |
| 2.745 | 10.527 |
| 2.746 | 10.527 |
| 2.747 | 10.527 |
| 2.748 | 10.527 |
| 2.749 | 10.527 |
| 2.75 | 10.527 |
| 2.751 | 10.526 |
| 2.752 | 10.526 |
| 2.753 | 10.526 |
| 2.754 | 10.526 |
| 2.755 | 10.526 |
| 2.756 | 10.526 |
| 2.757 | 10.526 |
| 2.758 | 10.526 |
| 2.759 | 10.526 |
| 2.76 | 10.526 |
| 2.761 | 10.526 |
| 2.762 | 10.526 |
| 2.763 | 10.526 |
| 2.764 | 10.526 |
| 2.765 | 10.526 |
| 2.766 | 10.525 |
| 2.767 | 10.525 |
| 2.768 | 10.525 |
| 2.769 | 10.525 |
| 2.77 | 10.525 |
| 2.771 | 10.525 |
| 2.772 | 10.525 |
| 2.773 | 10.525 |
| 2.774 | 10.525 |
| 2.775 | 10.525 |
| 2.776 | 10.525 |
| 2.777 | 10.525 |
| 2.778 | 10.525 |
| 2.779 | 10.525 |
| 2.78 | 10.525 |
| 2.781 | 10.524 |
| 2.782 | 10.524 |
| 2.783 | 10.524 |
| 2.784 | 10.524 |
| 2.785 | 10.524 |
| 2.786 | 10.524 |
| 2.787 | 10.524 |
| 2.788 | 10.524 |
| 2.789 | 10.524 |
| 2.79 | 10.524 |
| 2.791 | 10.524 |
| 2.792 | 10.524 |
| 2.793 | 10.524 |
| 2.794 | 10.524 |
| 2.795 | 10.524 |
| 2.796 | 10.524 |
| 2.797 | 10.523 |
| 2.798 | 10.523 |
| 2.799 | 10.523 |
| 2.8 | 10.523 |
| 2.801 | 10.523 |
| 2.802 | 10.523 |
| 2.803 | 10.523 |
| 2.804 | 10.523 |
| 2.805 | 10.523 |
| 2.806 | 10.523 |
| 2.807 | 10.523 |
| 2.808 | 10.523 |
| 2.809 | 10.523 |
| 2.81 | 10.523 |
| 2.811 | 10.523 |
| 2.812 | 10.522 |
| 2.813 | 10.522 |
| 2.814 | 10.522 |
| 2.815 | 10.522 |
| 2.816 | 10.522 |
| 2.817 | 10.522 |
| 2.818 | 10.522 |
| 2.819 | 10.522 |
| 2.82 | 10.522 |
| 2.821 | 10.522 |
| 2.822 | 10.522 |
| 2.823 | 10.522 |
| 2.824 | 10.522 |
| 2.825 | 10.522 |
| 2.826 | 10.522 |
| 2.827 | 10.522 |
| 2.828 | 10.521 |
| 2.829 | 10.521 |
| 2.83 | 10.521 |
| 2.831 | 10.521 |
| 2.832 | 10.521 |
| 2.833 | 10.521 |
| 2.834 | 10.521 |
| 2.835 | 10.521 |
| 2.836 | 10.521 |
| 2.837 | 10.521 |
| 2.838 | 10.521 |
| 2.839 | 10.521 |
| 2.84 | 10.521 |
| 2.841 | 10.521 |
| 2.842 | 10.521 |
| 2.843 | 10.521 |
| 2.844 | 10.52 |
| 2.845 | 10.52 |
| 2.846 | 10.52 |
| 2.847 | 10.52 |
| 2.848 | 10.52 |
| 2.849 | 10.52 |
| 2.85 | 10.52 |
| 2.851 | 10.52 |
| 2.852 | 10.52 |
| 2.853 | 10.52 |
| 2.854 | 10.52 |
| 2.855 | 10.52 |
| 2.856 | 10.52 |
| 2.857 | 10.52 |
| 2.858 | 10.52 |
| 2.859 | 10.52 |
| 2.86 | 10.519 |
| 2.861 | 10.519 |
| 2.862 | 10.519 |
| 2.863 | 10.519 |
| 2.864 | 10.519 |
| 2.865 | 10.519 |
| 2.866 | 10.519 |
| 2.867 | 10.519 |
| 2.868 | 10.519 |
| 2.869 | 10.519 |
| 2.87 | 10.519 |
| 2.871 | 10.519 |
| 2.872 | 10.519 |
| 2.873 | 10.519 |
| 2.874 | 10.519 |
| 2.875 | 10.519 |
| 2.876 | 10.518 |
| 2.877 | 10.518 |
| 2.878 | 10.518 |
| 2.879 | 10.518 |
| 2.88 | 10.518 |
| 2.881 | 10.518 |
| 2.882 | 10.518 |
| 2.883 | 10.518 |
| 2.884 | 10.518 |
| 2.885 | 10.518 |
| 2.886 | 10.518 |
| 2.887 | 10.518 |
| 2.888 | 10.518 |
| 2.889 | 10.518 |
| 2.89 | 10.518 |
| 2.891 | 10.518 |
| 2.892 | 10.517 |
| 2.893 | 10.517 |
| 2.894 | 10.517 |
| 2.895 | 10.517 |
| 2.896 | 10.517 |
| 2.897 | 10.517 |
| 2.898 | 10.517 |
| 2.899 | 10.517 |
| 2.9 | 10.517 |
| 2.901 | 10.517 |
| 2.902 | 10.517 |
| 2.903 | 10.517 |
| 2.904 | 10.517 |
| 2.905 | 10.517 |
| 2.906 | 10.517 |
| 2.907 | 10.517 |
| 2.908 | 10.516 |
| 2.909 | 10.516 |
| 2.91 | 10.516 |
| 2.911 | 10.516 |
| 2.912 | 10.516 |
| 2.913 | 10.516 |
| 2.914 | 10.516 |
| 2.915 | 10.516 |
| 2.916 | 10.516 |
| 2.917 | 10.516 |
| 2.918 | 10.516 |
| 2.919 | 10.516 |
| 2.92 | 10.516 |
| 2.921 | 10.516 |
| 2.922 | 10.516 |
| 2.923 | 10.516 |
| 2.924 | 10.516 |
| 2.925 | 10.515 |
| 2.926 | 10.515 |
| 2.927 | 10.515 |
| 2.928 | 10.515 |
| 2.929 | 10.515 |
| 2.93 | 10.515 |
| 2.931 | 10.515 |
| 2.932 | 10.515 |
| 2.933 | 10.515 |
| 2.934 | 10.515 |
| 2.935 | 10.515 |
| 2.936 | 10.515 |
| 2.937 | 10.515 |
| 2.938 | 10.515 |
| 2.939 | 10.515 |
| 2.94 | 10.515 |
| 2.941 | 10.514 |
| 2.942 | 10.514 |
| 2.943 | 10.514 |
| 2.944 | 10.514 |
| 2.945 | 10.514 |
| 2.946 | 10.514 |
| 2.947 | 10.514 |
| 2.948 | 10.514 |
| 2.949 | 10.514 |
| 2.95 | 10.514 |
| 2.951 | 10.514 |
| 2.952 | 10.514 |
| 2.953 | 10.514 |
| 2.954 | 10.514 |
| 2.955 | 10.514 |
| 2.956 | 10.514 |
| 2.957 | 10.513 |
| 2.958 | 10.513 |
| 2.959 | 10.513 |
| 2.96 | 10.513 |
| 2.961 | 10.513 |
| 2.962 | 10.513 |
| 2.963 | 10.513 |
| 2.964 | 10.513 |
| 2.965 | 10.513 |
| 2.966 | 10.513 |
| 2.967 | 10.513 |
| 2.968 | 10.513 |
| 2.969 | 10.513 |
| 2.97 | 10.513 |
| 2.971 | 10.513 |
| 2.972 | 10.513 |
| 2.973 | 10.513 |
| 2.974 | 10.512 |
| 2.975 | 10.512 |
| 2.976 | 10.512 |
| 2.977 | 10.512 |
| 2.978 | 10.512 |
| 2.979 | 10.512 |
| 2.98 | 10.512 |
| 2.981 | 10.512 |
| 2.982 | 10.512 |
| 2.983 | 10.512 |
| 2.984 | 10.512 |
| 2.985 | 10.512 |
| 2.986 | 10.512 |
| 2.987 | 10.512 |
| 2.988 | 10.512 |
| 2.989 | 10.512 |
| 2.99 | 10.512 |
| 2.991 | 10.511 |
| 2.992 | 10.511 |
| 2.993 | 10.511 |
| 2.994 | 10.511 |
| 2.995 | 10.511 |
| 2.996 | 10.511 |
| 2.997 | 10.511 |
| 2.998 | 10.511 |
| 2.999 | 10.511 |
| 3.0 | 10.511 |
| 3.001 | 10.511 |
| 3.002 | 10.511 |
| 3.003 | 10.511 |
| 3.004 | 10.511 |
| 3.005 | 10.511 |
| 3.006 | 10.511 |
| 3.007 | 10.51 |
| 3.008 | 10.51 |
| 3.009 | 10.51 |
| 3.01 | 10.51 |
| 3.011 | 10.51 |
| 3.012 | 10.51 |
| 3.013 | 10.51 |
| 3.014 | 10.51 |
| 3.015 | 10.51 |
| 3.016 | 10.51 |
| 3.017 | 10.51 |
| 3.018 | 10.51 |
| 3.019 | 10.51 |
| 3.02 | 10.51 |
| 3.021 | 10.51 |
| 3.022 | 10.51 |
| 3.023 | 10.51 |
| 3.024 | 10.509 |
| 3.025 | 10.509 |
| 3.026 | 10.509 |
| 3.027 | 10.509 |
| 3.028 | 10.509 |
| 3.029 | 10.509 |
| 3.03 | 10.509 |
| 3.031 | 10.509 |
| 3.032 | 10.509 |
| 3.033 | 10.509 |
| 3.034 | 10.509 |
| 3.035 | 10.509 |
| 3.036 | 10.509 |
| 3.037 | 10.509 |
| 3.038 | 10.509 |
| 3.039 | 10.509 |
| 3.04 | 10.509 |
| 3.041 | 10.508 |
| 3.042 | 10.508 |
| 3.043 | 10.508 |
| 3.044 | 10.508 |
| 3.045 | 10.508 |
| 3.046 | 10.508 |
| 3.047 | 10.508 |
| 3.048 | 10.508 |
| 3.049 | 10.508 |
| 3.05 | 10.508 |
| 3.051 | 10.508 |
| 3.052 | 10.508 |
| 3.053 | 10.508 |
| 3.054 | 10.508 |
| 3.055 | 10.508 |
| 3.056 | 10.508 |
| 3.057 | 10.508 |
| 3.058 | 10.507 |
| 3.059 | 10.507 |
| 3.06 | 10.507 |
| 3.061 | 10.507 |
| 3.062 | 10.507 |
| 3.063 | 10.507 |
| 3.064 | 10.507 |
| 3.065 | 10.507 |
| 3.066 | 10.507 |
| 3.067 | 10.507 |
| 3.068 | 10.507 |
| 3.069 | 10.507 |
| 3.07 | 10.507 |
| 3.071 | 10.507 |
| 3.072 | 10.507 |
| 3.073 | 10.507 |
| 3.074 | 10.507 |
| 3.075 | 10.506 |
| 3.076 | 10.506 |
| 3.077 | 10.506 |
| 3.078 | 10.506 |
| 3.079 | 10.506 |
| 3.08 | 10.506 |
| 3.081 | 10.506 |
| 3.082 | 10.506 |
| 3.083 | 10.506 |
| 3.084 | 10.506 |
| 3.085 | 10.506 |
| 3.086 | 10.506 |
| 3.087 | 10.506 |
| 3.088 | 10.506 |
| 3.089 | 10.506 |
| 3.09 | 10.506 |
| 3.091 | 10.506 |
| 3.092 | 10.506 |
| 3.093 | 10.505 |
| 3.094 | 10.505 |
| 3.095 | 10.505 |
| 3.096 | 10.505 |
| 3.097 | 10.505 |
| 3.098 | 10.505 |
| 3.099 | 10.505 |
| 3.1 | 10.505 |
| 3.101 | 10.505 |
| 3.102 | 10.505 |
| 3.103 | 10.505 |
| 3.104 | 10.505 |
| 3.105 | 10.505 |
| 3.106 | 10.505 |
| 3.107 | 10.505 |
| 3.108 | 10.505 |
| 3.109 | 10.505 |
| 3.11 | 10.504 |
| 3.111 | 10.504 |
| 3.112 | 10.504 |
| 3.113 | 10.504 |
| 3.114 | 10.504 |
| 3.115 | 10.504 |
| 3.116 | 10.504 |
| 3.117 | 10.504 |
| 3.118 | 10.504 |
| 3.119 | 10.504 |
| 3.12 | 10.504 |
| 3.121 | 10.504 |
| 3.122 | 10.504 |
| 3.123 | 10.504 |
| 3.124 | 10.504 |
| 3.125 | 10.504 |
| 3.126 | 10.504 |
| 3.127 | 10.503 |
| 3.128 | 10.503 |
| 3.129 | 10.503 |
| 3.13 | 10.503 |
| 3.131 | 10.503 |
| 3.132 | 10.503 |
| 3.133 | 10.503 |
| 3.134 | 10.503 |
| 3.135 | 10.503 |
| 3.136 | 10.503 |
| 3.137 | 10.503 |
| 3.138 | 10.503 |
| 3.139 | 10.503 |
| 3.14 | 10.503 |
| 3.141 | 10.503 |
| 3.142 | 10.503 |
| 3.143 | 10.503 |
| 3.144 | 10.503 |
| 3.145 | 10.502 |
| 3.146 | 10.502 |
| 3.147 | 10.502 |
| 3.148 | 10.502 |
| 3.149 | 10.502 |
| 3.15 | 10.502 |
| 3.151 | 10.502 |
| 3.152 | 10.502 |
| 3.153 | 10.502 |
| 3.154 | 10.502 |
| 3.155 | 10.502 |
| 3.156 | 10.502 |
| 3.157 | 10.502 |
| 3.158 | 10.502 |
| 3.159 | 10.502 |
| 3.16 | 10.502 |
| 3.161 | 10.502 |
| 3.162 | 10.501 |
| 3.163 | 10.501 |
| 3.164 | 10.501 |
| 3.165 | 10.501 |
| 3.166 | 10.501 |
| 3.167 | 10.501 |
| 3.168 | 10.501 |
| 3.169 | 10.501 |
| 3.17 | 10.501 |
| 3.171 | 10.501 |
| 3.172 | 10.501 |
| 3.173 | 10.501 |
| 3.174 | 10.501 |
| 3.175 | 10.501 |
| 3.176 | 10.501 |
| 3.177 | 10.501 |
| 3.178 | 10.501 |
| 3.179 | 10.501 |
| 3.18 | 10.5 |
| 3.181 | 10.5 |
| 3.182 | 10.5 |
| 3.183 | 10.5 |
| 3.184 | 10.5 |
| 3.185 | 10.5 |
| 3.186 | 10.5 |
| 3.187 | 10.5 |
| 3.188 | 10.5 |
| 3.189 | 10.5 |
| 3.19 | 10.5 |
| 3.191 | 10.5 |
| 3.192 | 10.5 |
| 3.193 | 10.5 |
| 3.194 | 10.5 |
| 3.195 | 10.5 |
| 3.196 | 10.5 |
| 3.197 | 10.5 |
| 3.198 | 10.499 |
| 3.199 | 10.499 |
| 3.2 | 10.499 |
| 3.201 | 10.499 |
| 3.202 | 10.499 |
| 3.203 | 10.499 |
| 3.204 | 10.499 |
| 3.205 | 10.499 |
| 3.206 | 10.499 |
| 3.207 | 10.499 |
| 3.208 | 10.499 |
| 3.209 | 10.499 |
| 3.21 | 10.499 |
| 3.211 | 10.499 |
| 3.212 | 10.499 |
| 3.213 | 10.499 |
| 3.214 | 10.499 |
| 3.215 | 10.498 |
| 3.216 | 10.498 |
| 3.217 | 10.498 |
| 3.218 | 10.498 |
| 3.219 | 10.498 |
| 3.22 | 10.498 |
| 3.221 | 10.498 |
| 3.222 | 10.498 |
| 3.223 | 10.498 |
| 3.224 | 10.498 |
| 3.225 | 10.498 |
| 3.226 | 10.498 |
| 3.227 | 10.498 |
| 3.228 | 10.498 |
| 3.229 | 10.498 |
| 3.23 | 10.498 |
| 3.231 | 10.498 |
| 3.232 | 10.498 |
| 3.233 | 10.497 |
| 3.234 | 10.497 |
| 3.235 | 10.497 |
| 3.236 | 10.497 |
| 3.237 | 10.497 |
| 3.238 | 10.497 |
| 3.239 | 10.497 |
| 3.24 | 10.497 |
| 3.241 | 10.497 |
| 3.242 | 10.497 |
| 3.243 | 10.497 |
| 3.244 | 10.497 |
| 3.245 | 10.497 |
| 3.246 | 10.497 |
| 3.247 | 10.497 |
| 3.248 | 10.497 |
| 3.249 | 10.497 |
| 3.25 | 10.497 |
| 3.251 | 10.496 |
| 3.252 | 10.496 |
| 3.253 | 10.496 |
| 3.254 | 10.496 |
| 3.255 | 10.496 |
| 3.256 | 10.496 |
| 3.257 | 10.496 |
| 3.258 | 10.496 |
| 3.259 | 10.496 |
| 3.26 | 10.496 |
| 3.261 | 10.496 |
| 3.262 | 10.496 |
| 3.263 | 10.496 |
| 3.264 | 10.496 |
| 3.265 | 10.496 |
| 3.266 | 10.496 |
| 3.267 | 10.496 |
| 3.268 | 10.496 |
| 3.269 | 10.495 |
| 3.27 | 10.495 |
| 3.271 | 10.495 |
| 3.272 | 10.495 |
| 3.273 | 10.495 |
| 3.274 | 10.495 |
| 3.275 | 10.495 |
| 3.276 | 10.495 |
| 3.277 | 10.495 |
| 3.278 | 10.495 |
| 3.279 | 10.495 |
| 3.28 | 10.495 |
| 3.281 | 10.495 |
| 3.282 | 10.495 |
| 3.283 | 10.495 |
| 3.284 | 10.495 |
| 3.285 | 10.495 |
| 3.286 | 10.495 |
| 3.287 | 10.494 |
| 3.288 | 10.494 |
| 3.289 | 10.494 |
| 3.29 | 10.494 |
| 3.291 | 10.494 |
| 3.292 | 10.494 |
| 3.293 | 10.494 |
| 3.294 | 10.494 |
| 3.295 | 10.494 |
| 3.296 | 10.494 |
| 3.297 | 10.494 |
| 3.298 | 10.494 |
| 3.299 | 10.494 |
| 3.3 | 10.494 |
| 3.301 | 10.494 |
| 3.302 | 10.494 |
| 3.303 | 10.494 |
| 3.304 | 10.494 |
| 3.305 | 10.493 |
| 3.306 | 10.493 |
| 3.307 | 10.493 |
| 3.308 | 10.493 |
| 3.309 | 10.493 |
| 3.31 | 10.493 |
| 3.311 | 10.493 |
| 3.312 | 10.493 |
| 3.313 | 10.493 |
| 3.314 | 10.493 |
| 3.315 | 10.493 |
| 3.316 | 10.493 |
| 3.317 | 10.493 |
| 3.318 | 10.493 |
| 3.319 | 10.493 |
| 3.32 | 10.493 |
| 3.321 | 10.493 |
| 3.322 | 10.493 |
| 3.323 | 10.492 |
| 3.324 | 10.492 |
| 3.325 | 10.492 |
| 3.326 | 10.492 |
| 3.327 | 10.492 |
| 3.328 | 10.492 |
| 3.329 | 10.492 |
| 3.33 | 10.492 |
| 3.331 | 10.492 |
| 3.332 | 10.492 |
| 3.333 | 10.492 |
| 3.334 | 10.492 |
| 3.335 | 10.492 |
| 3.336 | 10.492 |
| 3.337 | 10.492 |
| 3.338 | 10.492 |
| 3.339 | 10.492 |
| 3.34 | 10.492 |
| 3.341 | 10.491 |
| 3.342 | 10.491 |
| 3.343 | 10.491 |
| 3.344 | 10.491 |
| 3.345 | 10.491 |
| 3.346 | 10.491 |
| 3.347 | 10.491 |
| 3.348 | 10.491 |
| 3.349 | 10.491 |
| 3.35 | 10.491 |
| 3.351 | 10.491 |
| 3.352 | 10.491 |
| 3.353 | 10.491 |
| 3.354 | 10.491 |
| 3.355 | 10.491 |
| 3.356 | 10.491 |
| 3.357 | 10.491 |
| 3.358 | 10.491 |
| 3.359 | 10.49 |
| 3.36 | 10.49 |
| 3.361 | 10.49 |
| 3.362 | 10.49 |
| 3.363 | 10.49 |
| 3.364 | 10.49 |
| 3.365 | 10.49 |
| 3.366 | 10.49 |
| 3.367 | 10.49 |
| 3.368 | 10.49 |
| 3.369 | 10.49 |
| 3.37 | 10.49 |
| 3.371 | 10.49 |
| 3.372 | 10.49 |
| 3.373 | 10.49 |
| 3.374 | 10.49 |
| 3.375 | 10.49 |
| 3.376 | 10.49 |
| 3.377 | 10.49 |
| 3.378 | 10.489 |
| 3.379 | 10.489 |
| 3.38 | 10.489 |
| 3.381 | 10.489 |
| 3.382 | 10.489 |
| 3.383 | 10.489 |
| 3.384 | 10.489 |
| 3.385 | 10.489 |
| 3.386 | 10.489 |
| 3.387 | 10.489 |
| 3.388 | 10.489 |
| 3.389 | 10.489 |
| 3.39 | 10.489 |
| 3.391 | 10.489 |
| 3.392 | 10.489 |
| 3.393 | 10.489 |
| 3.394 | 10.489 |
| 3.395 | 10.489 |
| 3.396 | 10.488 |
| 3.397 | 10.488 |
| 3.398 | 10.488 |
| 3.399 | 10.488 |
| 3.4 | 10.488 |
| 3.401 | 10.488 |
| 3.402 | 10.488 |
| 3.403 | 10.488 |
| 3.404 | 10.488 |
| 3.405 | 10.488 |
| 3.406 | 10.488 |
| 3.407 | 10.488 |
| 3.408 | 10.488 |
| 3.409 | 10.488 |
| 3.41 | 10.488 |
| 3.411 | 10.488 |
| 3.412 | 10.488 |
| 3.413 | 10.488 |
| 3.414 | 10.488 |
| 3.415 | 10.487 |
| 3.416 | 10.487 |
| 3.417 | 10.487 |
| 3.418 | 10.487 |
| 3.419 | 10.487 |
| 3.42 | 10.487 |
| 3.421 | 10.487 |
| 3.422 | 10.487 |
| 3.423 | 10.487 |
| 3.424 | 10.487 |
| 3.425 | 10.487 |
| 3.426 | 10.487 |
| 3.427 | 10.487 |
| 3.428 | 10.487 |
| 3.429 | 10.487 |
| 3.43 | 10.487 |
| 3.431 | 10.487 |
| 3.432 | 10.487 |
| 3.433 | 10.486 |
| 3.434 | 10.486 |
| 3.435 | 10.486 |
| 3.436 | 10.486 |
| 3.437 | 10.486 |
| 3.438 | 10.486 |
| 3.439 | 10.486 |
| 3.44 | 10.486 |
| 3.441 | 10.486 |
| 3.442 | 10.486 |
| 3.443 | 10.486 |
| 3.444 | 10.486 |
| 3.445 | 10.486 |
| 3.446 | 10.486 |
| 3.447 | 10.486 |
| 3.448 | 10.486 |
| 3.449 | 10.486 |
| 3.45 | 10.486 |
| 3.451 | 10.485 |
| 3.452 | 10.485 |
| 3.453 | 10.485 |
| 3.454 | 10.485 |
| 3.455 | 10.485 |
| 3.456 | 10.485 |
| 3.457 | 10.485 |
| 3.458 | 10.485 |
| 3.459 | 10.485 |
| 3.46 | 10.485 |
| 3.461 | 10.485 |
| 3.462 | 10.485 |
| 3.463 | 10.485 |
| 3.464 | 10.485 |
| 3.465 | 10.485 |
| 3.466 | 10.485 |
| 3.467 | 10.485 |
| 3.468 | 10.485 |
| 3.469 | 10.485 |
| 3.47 | 10.484 |
| 3.471 | 10.484 |
| 3.472 | 10.484 |
| 3.473 | 10.484 |
| 3.474 | 10.484 |
| 3.475 | 10.484 |
| 3.476 | 10.484 |
| 3.477 | 10.484 |
| 3.478 | 10.484 |
| 3.479 | 10.484 |
| 3.48 | 10.484 |
| 3.481 | 10.484 |
| 3.482 | 10.484 |
| 3.483 | 10.484 |
| 3.484 | 10.484 |
| 3.485 | 10.484 |
| 3.486 | 10.484 |
| 3.487 | 10.484 |
| 3.488 | 10.483 |
| 3.489 | 10.483 |
| 3.49 | 10.483 |
| 3.491 | 10.483 |
| 3.492 | 10.483 |
| 3.493 | 10.483 |
| 3.494 | 10.483 |
| 3.495 | 10.483 |
| 3.496 | 10.483 |
| 3.497 | 10.483 |
| 3.498 | 10.483 |
| 3.499 | 10.483 |
| 3.5 | 10.483 |
| 3.501 | 10.483 |
| 3.502 | 10.483 |
| 3.503 | 10.483 |
| 3.504 | 10.483 |
| 3.505 | 10.483 |
| 3.506 | 10.483 |
| 3.507 | 10.482 |
| 3.508 | 10.482 |
| 3.509 | 10.482 |
| 3.51 | 10.482 |
| 3.511 | 10.482 |
| 3.512 | 10.482 |
| 3.513 | 10.482 |
| 3.514 | 10.482 |
| 3.515 | 10.482 |
| 3.516 | 10.482 |
| 3.517 | 10.482 |
| 3.518 | 10.482 |
| 3.519 | 10.482 |
| 3.52 | 10.482 |
| 3.521 | 10.482 |
| 3.522 | 10.482 |
| 3.523 | 10.482 |
| 3.524 | 10.482 |
| 3.525 | 10.482 |
| 3.526 | 10.481 |
| 3.527 | 10.481 |
| 3.528 | 10.481 |
| 3.529 | 10.481 |
| 3.53 | 10.481 |
| 3.531 | 10.481 |
| 3.532 | 10.481 |
| 3.533 | 10.481 |
| 3.534 | 10.481 |
| 3.535 | 10.481 |
| 3.536 | 10.481 |
| 3.537 | 10.481 |
| 3.538 | 10.481 |
| 3.539 | 10.481 |
| 3.54 | 10.481 |
| 3.541 | 10.481 |
| 3.542 | 10.481 |
| 3.543 | 10.481 |
| 3.544 | 10.48 |
| 3.545 | 10.48 |
| 3.546 | 10.48 |
| 3.547 | 10.48 |
| 3.548 | 10.48 |
| 3.549 | 10.48 |
| 3.55 | 10.48 |
| 3.551 | 10.48 |
| 3.552 | 10.48 |
| 3.553 | 10.48 |
| 3.554 | 10.48 |
| 3.555 | 10.48 |
| 3.556 | 10.48 |
| 3.557 | 10.48 |
| 3.558 | 10.48 |
| 3.559 | 10.48 |
| 3.56 | 10.48 |
| 3.561 | 10.48 |
| 3.562 | 10.48 |
| 3.563 | 10.479 |
| 3.564 | 10.479 |
| 3.565 | 10.479 |
| 3.566 | 10.479 |
| 3.567 | 10.479 |
| 3.568 | 10.479 |
| 3.569 | 10.479 |
| 3.57 | 10.479 |
| 3.571 | 10.479 |
| 3.572 | 10.479 |
| 3.573 | 10.479 |
| 3.574 | 10.479 |
| 3.575 | 10.479 |
| 3.576 | 10.479 |
| 3.577 | 10.479 |
| 3.578 | 10.479 |
| 3.579 | 10.479 |
| 3.58 | 10.479 |
| 3.581 | 10.479 |
| 3.582 | 10.478 |
| 3.583 | 10.478 |
| 3.584 | 10.478 |
| 3.585 | 10.478 |
| 3.586 | 10.478 |
| 3.587 | 10.478 |
| 3.588 | 10.478 |
| 3.589 | 10.478 |
| 3.59 | 10.478 |
| 3.591 | 10.478 |
| 3.592 | 10.478 |
| 3.593 | 10.478 |
| 3.594 | 10.478 |
| 3.595 | 10.478 |
| 3.596 | 10.478 |
| 3.597 | 10.478 |
| 3.598 | 10.478 |
| 3.599 | 10.478 |
| 3.6 | 10.477 |
| 3.601 | 10.477 |
| 3.602 | 10.477 |
| 3.603 | 10.477 |
| 3.604 | 10.477 |
| 3.605 | 10.477 |
| 3.606 | 10.477 |
| 3.607 | 10.477 |
| 3.608 | 10.477 |
| 3.609 | 10.477 |
| 3.61 | 10.477 |
| 3.611 | 10.477 |
| 3.612 | 10.477 |
| 3.613 | 10.477 |
| 3.614 | 10.477 |
| 3.615 | 10.477 |
| 3.616 | 10.477 |
| 3.617 | 10.477 |
| 3.618 | 10.477 |
| 3.619 | 10.476 |
| 3.62 | 10.476 |
| 3.621 | 10.476 |
| 3.622 | 10.476 |
| 3.623 | 10.476 |
| 3.624 | 10.476 |
| 3.625 | 10.476 |
| 3.626 | 10.476 |
| 3.627 | 10.476 |
| 3.628 | 10.476 |
| 3.629 | 10.476 |
| 3.63 | 10.476 |
| 3.631 | 10.476 |
| 3.632 | 10.476 |
| 3.633 | 10.476 |
| 3.634 | 10.476 |
| 3.635 | 10.476 |
| 3.636 | 10.476 |
| 3.637 | 10.476 |
| 3.638 | 10.475 |
| 3.639 | 10.475 |
| 3.64 | 10.475 |
| 3.641 | 10.475 |
| 3.642 | 10.475 |
| 3.643 | 10.475 |
| 3.644 | 10.475 |
| 3.645 | 10.475 |
| 3.646 | 10.475 |
| 3.647 | 10.475 |
| 3.648 | 10.475 |
| 3.649 | 10.475 |
| 3.65 | 10.475 |
| 3.651 | 10.475 |
| 3.652 | 10.475 |
| 3.653 | 10.475 |
| 3.654 | 10.475 |
| 3.655 | 10.475 |
| 3.656 | 10.475 |
| 3.657 | 10.474 |
| 3.658 | 10.474 |
| 3.659 | 10.474 |
| 3.66 | 10.474 |
| 3.661 | 10.474 |
| 3.662 | 10.474 |
| 3.663 | 10.474 |
| 3.664 | 10.474 |
| 3.665 | 10.474 |
| 3.666 | 10.474 |
| 3.667 | 10.474 |
| 3.668 | 10.474 |
| 3.669 | 10.474 |
| 3.67 | 10.474 |
| 3.671 | 10.474 |
| 3.672 | 10.474 |
| 3.673 | 10.474 |
| 3.674 | 10.474 |
| 3.675 | 10.474 |
| 3.676 | 10.473 |
| 3.677 | 10.473 |
| 3.678 | 10.473 |
| 3.679 | 10.473 |
| 3.68 | 10.473 |
| 3.681 | 10.473 |
| 3.682 | 10.473 |
| 3.683 | 10.473 |
| 3.684 | 10.473 |
| 3.685 | 10.473 |
| 3.686 | 10.473 |
| 3.687 | 10.473 |
| 3.688 | 10.473 |
| 3.689 | 10.473 |
| 3.69 | 10.473 |
| 3.691 | 10.473 |
| 3.692 | 10.473 |
| 3.693 | 10.473 |
| 3.694 | 10.472 |
| 3.695 | 10.472 |
| 3.696 | 10.472 |
| 3.697 | 10.472 |
| 3.698 | 10.472 |
| 3.699 | 10.472 |
| 3.7 | 10.472 |
| 3.701 | 10.472 |
| 3.702 | 10.472 |
| 3.703 | 10.472 |
| 3.704 | 10.472 |
| 3.705 | 10.472 |
| 3.706 | 10.472 |
| 3.707 | 10.472 |
| 3.708 | 10.472 |
| 3.709 | 10.472 |
| 3.71 | 10.472 |
| 3.711 | 10.472 |
| 3.712 | 10.472 |
| 3.713 | 10.471 |
| 3.714 | 10.471 |
| 3.715 | 10.471 |
| 3.716 | 10.471 |
| 3.717 | 10.471 |
| 3.718 | 10.471 |
| 3.719 | 10.471 |
| 3.72 | 10.471 |
| 3.721 | 10.471 |
| 3.722 | 10.471 |
| 3.723 | 10.471 |
| 3.724 | 10.471 |
| 3.725 | 10.471 |
| 3.726 | 10.471 |
| 3.727 | 10.471 |
| 3.728 | 10.471 |
| 3.729 | 10.471 |
| 3.73 | 10.471 |
| 3.731 | 10.471 |
| 3.732 | 10.47 |
| 3.733 | 10.47 |
| 3.734 | 10.47 |
| 3.735 | 10.47 |
| 3.736 | 10.47 |
| 3.737 | 10.47 |
| 3.738 | 10.47 |
| 3.739 | 10.47 |
| 3.74 | 10.47 |
| 3.741 | 10.47 |
| 3.742 | 10.47 |
| 3.743 | 10.47 |
| 3.744 | 10.47 |
| 3.745 | 10.47 |
| 3.746 | 10.47 |
| 3.747 | 10.47 |
| 3.748 | 10.47 |
| 3.749 | 10.47 |
| 3.75 | 10.47 |
| 3.751 | 10.469 |
| 3.752 | 10.469 |
| 3.753 | 10.469 |
| 3.754 | 10.469 |
| 3.755 | 10.469 |
| 3.756 | 10.469 |
| 3.757 | 10.469 |
| 3.758 | 10.469 |
| 3.759 | 10.469 |
| 3.76 | 10.469 |
| 3.761 | 10.469 |
| 3.762 | 10.469 |
| 3.763 | 10.469 |
| 3.764 | 10.469 |
| 3.765 | 10.469 |
| 3.766 | 10.469 |
| 3.767 | 10.469 |
| 3.768 | 10.469 |
| 3.769 | 10.469 |
| 3.77 | 10.468 |
| 3.771 | 10.468 |
| 3.772 | 10.468 |
| 3.773 | 10.468 |
| 3.774 | 10.468 |
| 3.775 | 10.468 |
| 3.776 | 10.468 |
| 3.777 | 10.468 |
| 3.778 | 10.468 |
| 3.779 | 10.468 |
| 3.78 | 10.468 |
| 3.781 | 10.468 |
| 3.782 | 10.468 |
| 3.783 | 10.468 |
| 3.784 | 10.468 |
| 3.785 | 10.468 |
| 3.786 | 10.468 |
| 3.787 | 10.468 |
| 3.788 | 10.468 |
| 3.789 | 10.467 |
| 3.79 | 10.467 |
| 3.791 | 10.467 |
| 3.792 | 10.467 |
| 3.793 | 10.467 |
| 3.794 | 10.467 |
| 3.795 | 10.467 |
| 3.796 | 10.467 |
| 3.797 | 10.467 |
| 3.798 | 10.467 |
| 3.799 | 10.467 |
| 3.8 | 10.467 |
| 3.801 | 10.467 |
| 3.802 | 10.467 |
| 3.803 | 10.467 |
| 3.804 | 10.467 |
| 3.805 | 10.467 |
| 3.806 | 10.467 |
| 3.807 | 10.467 |
| 3.808 | 10.466 |
| 3.809 | 10.466 |
| 3.81 | 10.466 |
| 3.811 | 10.466 |
| 3.812 | 10.466 |
| 3.813 | 10.466 |
| 3.814 | 10.466 |
| 3.815 | 10.466 |
| 3.816 | 10.466 |
| 3.817 | 10.466 |
| 3.818 | 10.466 |
| 3.819 | 10.466 |
| 3.82 | 10.466 |
| 3.821 | 10.466 |
| 3.822 | 10.466 |
| 3.823 | 10.466 |
| 3.824 | 10.466 |
| 3.825 | 10.466 |
| 3.826 | 10.466 |
| 3.827 | 10.465 |
| 3.828 | 10.465 |
| 3.829 | 10.465 |
| 3.83 | 10.465 |
| 3.831 | 10.465 |
| 3.832 | 10.465 |
| 3.833 | 10.465 |
| 3.834 | 10.465 |
| 3.835 | 10.465 |
| 3.836 | 10.465 |
| 3.837 | 10.465 |
| 3.838 | 10.465 |
| 3.839 | 10.465 |
| 3.84 | 10.465 |
| 3.841 | 10.465 |
| 3.842 | 10.465 |
| 3.843 | 10.465 |
| 3.844 | 10.465 |
| 3.845 | 10.465 |
| 3.846 | 10.464 |
| 3.847 | 10.464 |
| 3.848 | 10.464 |
| 3.849 | 10.464 |
| 3.85 | 10.464 |
| 3.851 | 10.464 |
| 3.852 | 10.464 |
| 3.853 | 10.464 |
| 3.854 | 10.464 |
| 3.855 | 10.464 |
| 3.856 | 10.464 |
| 3.857 | 10.464 |
| 3.858 | 10.464 |
| 3.859 | 10.464 |
| 3.86 | 10.464 |
| 3.861 | 10.464 |
| 3.862 | 10.464 |
| 3.863 | 10.464 |
| 3.864 | 10.464 |
| 3.865 | 10.463 |
| 3.866 | 10.463 |
| 3.867 | 10.463 |
| 3.868 | 10.463 |
| 3.869 | 10.463 |
| 3.87 | 10.463 |
| 3.871 | 10.463 |
| 3.872 | 10.463 |
| 3.873 | 10.463 |
| 3.874 | 10.463 |
| 3.875 | 10.463 |
| 3.876 | 10.463 |
| 3.877 | 10.463 |
| 3.878 | 10.463 |
| 3.879 | 10.463 |
| 3.88 | 10.463 |
| 3.881 | 10.463 |
| 3.882 | 10.463 |
| 3.883 | 10.463 |
| 3.884 | 10.462 |
| 3.885 | 10.462 |
| 3.886 | 10.462 |
| 3.887 | 10.462 |
| 3.888 | 10.462 |
| 3.889 | 10.462 |
| 3.89 | 10.462 |
| 3.891 | 10.462 |
| 3.892 | 10.462 |
| 3.893 | 10.462 |
| 3.894 | 10.462 |
| 3.895 | 10.462 |
| 3.896 | 10.462 |
| 3.897 | 10.462 |
| 3.898 | 10.462 |
| 3.899 | 10.462 |
| 3.9 | 10.462 |
| 3.901 | 10.462 |
| 3.902 | 10.462 |
| 3.903 | 10.461 |
| 3.904 | 10.461 |
| 3.905 | 10.461 |
| 3.906 | 10.461 |
| 3.907 | 10.461 |
| 3.908 | 10.461 |
| 3.909 | 10.461 |
| 3.91 | 10.461 |
| 3.911 | 10.461 |
| 3.912 | 10.461 |
| 3.913 | 10.461 |
| 3.914 | 10.461 |
| 3.915 | 10.461 |
| 3.916 | 10.461 |
| 3.917 | 10.461 |
| 3.918 | 10.461 |
| 3.919 | 10.461 |
| 3.92 | 10.461 |
| 3.921 | 10.461 |
| 3.922 | 10.46 |
| 3.923 | 10.46 |
| 3.924 | 10.46 |
| 3.925 | 10.46 |
| 3.926 | 10.46 |
| 3.927 | 10.46 |
| 3.928 | 10.46 |
| 3.929 | 10.46 |
| 3.93 | 10.46 |
| 3.931 | 10.46 |
| 3.932 | 10.46 |
| 3.933 | 10.46 |
| 3.934 | 10.46 |
| 3.935 | 10.46 |
| 3.936 | 10.46 |
| 3.937 | 10.46 |
| 3.938 | 10.46 |
| 3.939 | 10.46 |
| 3.94 | 10.46 |
| 3.941 | 10.459 |
| 3.942 | 10.459 |
| 3.943 | 10.459 |
| 3.944 | 10.459 |
| 3.945 | 10.459 |
| 3.946 | 10.459 |
| 3.947 | 10.459 |
| 3.948 | 10.459 |
| 3.949 | 10.459 |
| 3.95 | 10.459 |
| 3.951 | 10.459 |
| 3.952 | 10.459 |
| 3.953 | 10.459 |
| 3.954 | 10.459 |
| 3.955 | 10.459 |
| 3.956 | 10.459 |
| 3.957 | 10.459 |
| 3.958 | 10.459 |
| 3.959 | 10.459 |
| 3.96 | 10.458 |
| 3.961 | 10.458 |
| 3.962 | 10.458 |
| 3.963 | 10.458 |
| 3.964 | 10.458 |
| 3.965 | 10.458 |
| 3.966 | 10.458 |
| 3.967 | 10.458 |
| 3.968 | 10.458 |
| 3.969 | 10.458 |
| 3.97 | 10.458 |
| 3.971 | 10.458 |
| 3.972 | 10.458 |
| 3.973 | 10.458 |
| 3.974 | 10.458 |
| 3.975 | 10.458 |
| 3.976 | 10.458 |
| 3.977 | 10.458 |
| 3.978 | 10.458 |
| 3.979 | 10.457 |
| 3.98 | 10.457 |
| 3.981 | 10.457 |
| 3.982 | 10.457 |
| 3.983 | 10.457 |
| 3.984 | 10.457 |
| 3.985 | 10.457 |
| 3.986 | 10.457 |
| 3.987 | 10.457 |
| 3.988 | 10.457 |
| 3.989 | 10.457 |
| 3.99 | 10.457 |
| 3.991 | 10.457 |
| 3.992 | 10.457 |
| 3.993 | 10.457 |
| 3.994 | 10.457 |
| 3.995 | 10.457 |
| 3.996 | 10.457 |
| 3.997 | 10.456 |
| 3.998 | 10.456 |
| 3.999 | 10.456 |
| 4.0 | 10.456 |
| 4.001 | 10.456 |
| 4.002 | 10.456 |
| 4.003 | 10.456 |
| 4.004 | 10.456 |
| 4.005 | 10.456 |
| 4.006 | 10.456 |
| 4.007 | 10.456 |
| 4.008 | 10.456 |
| 4.009 | 10.456 |
| 4.01 | 10.456 |
| 4.011 | 10.456 |
| 4.012 | 10.456 |
| 4.013 | 10.456 |
| 4.014 | 10.456 |
| 4.015 | 10.456 |
| 4.016 | 10.456 |
| 4.017 | 10.455 |
| 4.018 | 10.455 |
| 4.019 | 10.455 |
| 4.02 | 10.455 |
| 4.021 | 10.455 |
| 4.022 | 10.455 |
| 4.023 | 10.455 |
| 4.024 | 10.455 |
| 4.025 | 10.455 |
| 4.026 | 10.455 |
| 4.027 | 10.455 |
| 4.028 | 10.455 |
| 4.029 | 10.455 |
| 4.03 | 10.455 |
| 4.031 | 10.455 |
| 4.032 | 10.455 |
| 4.033 | 10.455 |
| 4.034 | 10.455 |
| 4.035 | 10.454 |
| 4.036 | 10.454 |
| 4.037 | 10.454 |
| 4.038 | 10.454 |
| 4.039 | 10.454 |
| 4.04 | 10.454 |
| 4.041 | 10.454 |
| 4.042 | 10.454 |
| 4.043 | 10.454 |
| 4.044 | 10.454 |
| 4.045 | 10.454 |
| 4.046 | 10.454 |
| 4.047 | 10.454 |
| 4.048 | 10.454 |
| 4.049 | 10.454 |
| 4.05 | 10.454 |
| 4.051 | 10.454 |
| 4.052 | 10.454 |
| 4.053 | 10.454 |
| 4.054 | 10.454 |
| 4.055 | 10.453 |
| 4.056 | 10.453 |
| 4.057 | 10.453 |
| 4.058 | 10.453 |
| 4.059 | 10.453 |
| 4.06 | 10.453 |
| 4.061 | 10.453 |
| 4.062 | 10.453 |
| 4.063 | 10.453 |
| 4.064 | 10.453 |
| 4.065 | 10.453 |
| 4.066 | 10.453 |
| 4.067 | 10.453 |
| 4.068 | 10.453 |
| 4.069 | 10.453 |
| 4.07 | 10.453 |
| 4.071 | 10.453 |
| 4.072 | 10.453 |
| 4.073 | 10.452 |
| 4.074 | 10.452 |
| 4.075 | 10.452 |
| 4.076 | 10.452 |
| 4.077 | 10.452 |
| 4.078 | 10.452 |
| 4.079 | 10.452 |
| 4.08 | 10.452 |
| 4.081 | 10.452 |
| 4.082 | 10.452 |
| 4.083 | 10.452 |
| 4.084 | 10.452 |
| 4.085 | 10.452 |
| 4.086 | 10.452 |
| 4.087 | 10.452 |
| 4.088 | 10.452 |
| 4.089 | 10.452 |
| 4.09 | 10.452 |
| 4.091 | 10.452 |
| 4.092 | 10.451 |
| 4.093 | 10.451 |
| 4.094 | 10.451 |
| 4.095 | 10.451 |
| 4.096 | 10.451 |
| 4.097 | 10.451 |
| 4.098 | 10.451 |
| 4.099 | 10.451 |
| 4.1 | 10.451 |
| 4.101 | 10.451 |
| 4.102 | 10.451 |
| 4.103 | 10.451 |
| 4.104 | 10.451 |
| 4.105 | 10.451 |
| 4.106 | 10.451 |
| 4.107 | 10.451 |
| 4.108 | 10.451 |
| 4.109 | 10.451 |
| 4.11 | 10.451 |
| 4.111 | 10.45 |
| 4.112 | 10.45 |
| 4.113 | 10.45 |
| 4.114 | 10.45 |
| 4.115 | 10.45 |
| 4.116 | 10.45 |
| 4.117 | 10.45 |
| 4.118 | 10.45 |
| 4.119 | 10.45 |
| 4.12 | 10.45 |
| 4.121 | 10.45 |
| 4.122 | 10.45 |
| 4.123 | 10.45 |
| 4.124 | 10.45 |
| 4.125 | 10.45 |
| 4.126 | 10.45 |
| 4.127 | 10.45 |
| 4.128 | 10.45 |
| 4.129 | 10.45 |
| 4.13 | 10.449 |
| 4.131 | 10.449 |
| 4.132 | 10.449 |
| 4.133 | 10.449 |
| 4.134 | 10.449 |
| 4.135 | 10.449 |
| 4.136 | 10.449 |
| 4.137 | 10.449 |
| 4.138 | 10.449 |
| 4.139 | 10.449 |
| 4.14 | 10.449 |
| 4.141 | 10.449 |
| 4.142 | 10.449 |
| 4.143 | 10.449 |
| 4.144 | 10.449 |
| 4.145 | 10.449 |
| 4.146 | 10.449 |
| 4.147 | 10.449 |
| 4.148 | 10.449 |
| 4.149 | 10.448 |
| 4.15 | 10.448 |
| 4.151 | 10.448 |
| 4.152 | 10.448 |
| 4.153 | 10.448 |
| 4.154 | 10.448 |
| 4.155 | 10.448 |
| 4.156 | 10.448 |
| 4.157 | 10.448 |
| 4.158 | 10.448 |
| 4.159 | 10.448 |
| 4.16 | 10.448 |
| 4.161 | 10.448 |
| 4.162 | 10.448 |
| 4.163 | 10.448 |
| 4.164 | 10.448 |
| 4.165 | 10.448 |
| 4.166 | 10.448 |
| 4.167 | 10.448 |
| 4.168 | 10.447 |
| 4.169 | 10.447 |
| 4.17 | 10.447 |
| 4.171 | 10.447 |
| 4.172 | 10.447 |
| 4.173 | 10.447 |
| 4.174 | 10.447 |
| 4.175 | 10.447 |
| 4.176 | 10.447 |
| 4.177 | 10.447 |
| 4.178 | 10.447 |
| 4.179 | 10.447 |
| 4.18 | 10.447 |
| 4.181 | 10.447 |
| 4.182 | 10.447 |
| 4.183 | 10.447 |
| 4.184 | 10.447 |
| 4.185 | 10.447 |
| 4.186 | 10.447 |
| 4.187 | 10.446 |
| 4.188 | 10.446 |
| 4.189 | 10.446 |
| 4.19 | 10.446 |
| 4.191 | 10.446 |
| 4.192 | 10.446 |
| 4.193 | 10.446 |
| 4.194 | 10.446 |
| 4.195 | 10.446 |
| 4.196 | 10.446 |
| 4.197 | 10.446 |
| 4.198 | 10.446 |
| 4.199 | 10.446 |
| 4.2 | 10.446 |
| 4.201 | 10.446 |
| 4.202 | 10.446 |
| 4.203 | 10.446 |
| 4.204 | 10.446 |
| 4.205 | 10.446 |
| 4.206 | 10.445 |
| 4.207 | 10.445 |
| 4.208 | 10.445 |
| 4.209 | 10.445 |
| 4.21 | 10.445 |
| 4.211 | 10.445 |
| 4.212 | 10.445 |
| 4.213 | 10.445 |
| 4.214 | 10.445 |
| 4.215 | 10.445 |
| 4.216 | 10.445 |
| 4.217 | 10.445 |
| 4.218 | 10.445 |
| 4.219 | 10.445 |
| 4.22 | 10.445 |
| 4.221 | 10.445 |
| 4.222 | 10.445 |
| 4.223 | 10.445 |
| 4.224 | 10.444 |
| 4.225 | 10.444 |
| 4.226 | 10.444 |
| 4.227 | 10.444 |
| 4.228 | 10.444 |
| 4.229 | 10.444 |
| 4.23 | 10.444 |
| 4.231 | 10.444 |
| 4.232 | 10.444 |
| 4.233 | 10.444 |
| 4.234 | 10.444 |
| 4.235 | 10.444 |
| 4.236 | 10.444 |
| 4.237 | 10.444 |
| 4.238 | 10.444 |
| 4.239 | 10.444 |
| 4.24 | 10.444 |
| 4.241 | 10.444 |
| 4.242 | 10.444 |
| 4.243 | 10.443 |
| 4.244 | 10.443 |
| 4.245 | 10.443 |
| 4.246 | 10.443 |
| 4.247 | 10.443 |
| 4.248 | 10.443 |
| 4.249 | 10.443 |
| 4.25 | 10.443 |
| 4.251 | 10.443 |
| 4.252 | 10.443 |
| 4.253 | 10.443 |
| 4.254 | 10.443 |
| 4.255 | 10.443 |
| 4.256 | 10.443 |
| 4.257 | 10.443 |
| 4.258 | 10.443 |
| 4.259 | 10.443 |
| 4.26 | 10.443 |
| 4.261 | 10.443 |
| 4.262 | 10.442 |
| 4.263 | 10.442 |
| 4.264 | 10.442 |
| 4.265 | 10.442 |
| 4.266 | 10.442 |
| 4.267 | 10.442 |
| 4.268 | 10.442 |
| 4.269 | 10.442 |
| 4.27 | 10.442 |
| 4.271 | 10.442 |
| 4.272 | 10.442 |
| 4.273 | 10.442 |
| 4.274 | 10.442 |
| 4.275 | 10.442 |
| 4.276 | 10.442 |
| 4.277 | 10.442 |
| 4.278 | 10.442 |
| 4.279 | 10.442 |
| 4.28 | 10.442 |
| 4.281 | 10.441 |
| 4.282 | 10.441 |
| 4.283 | 10.441 |
| 4.284 | 10.441 |
| 4.285 | 10.441 |
| 4.286 | 10.441 |
| 4.287 | 10.441 |
| 4.288 | 10.441 |
| 4.289 | 10.441 |
| 4.29 | 10.441 |
| 4.291 | 10.441 |
| 4.292 | 10.441 |
| 4.293 | 10.441 |
| 4.294 | 10.441 |
| 4.295 | 10.441 |
| 4.296 | 10.441 |
| 4.297 | 10.441 |
| 4.298 | 10.441 |
| 4.299 | 10.441 |
| 4.3 | 10.44 |
| 4.301 | 10.44 |
| 4.302 | 10.44 |
| 4.303 | 10.44 |
| 4.304 | 10.44 |
| 4.305 | 10.44 |
| 4.306 | 10.44 |
| 4.307 | 10.44 |
| 4.308 | 10.44 |
| 4.309 | 10.44 |
| 4.31 | 10.44 |
| 4.311 | 10.44 |
| 4.312 | 10.44 |
| 4.313 | 10.44 |
| 4.314 | 10.44 |
| 4.315 | 10.44 |
| 4.316 | 10.44 |
| 4.317 | 10.44 |
| 4.318 | 10.44 |
| 4.319 | 10.439 |
| 4.32 | 10.439 |
| 4.321 | 10.439 |
| 4.322 | 10.439 |
| 4.323 | 10.439 |
| 4.324 | 10.439 |
| 4.325 | 10.439 |
| 4.326 | 10.439 |
| 4.327 | 10.439 |
| 4.328 | 10.439 |
| 4.329 | 10.439 |
| 4.33 | 10.439 |
| 4.331 | 10.439 |
| 4.332 | 10.439 |
| 4.333 | 10.439 |
| 4.334 | 10.439 |
| 4.335 | 10.439 |
| 4.336 | 10.439 |
| 4.337 | 10.438 |
| 4.338 | 10.438 |
| 4.339 | 10.438 |
| 4.34 | 10.438 |
| 4.341 | 10.438 |
| 4.342 | 10.438 |
| 4.343 | 10.438 |
| 4.344 | 10.438 |
| 4.345 | 10.438 |
| 4.346 | 10.438 |
| 4.347 | 10.438 |
| 4.348 | 10.438 |
| 4.349 | 10.438 |
| 4.35 | 10.438 |
| 4.351 | 10.438 |
| 4.352 | 10.438 |
| 4.353 | 10.438 |
| 4.354 | 10.438 |
| 4.355 | 10.438 |
| 4.356 | 10.437 |
| 4.357 | 10.437 |
| 4.358 | 10.437 |
| 4.359 | 10.437 |
| 4.36 | 10.437 |
| 4.361 | 10.437 |
| 4.362 | 10.437 |
| 4.363 | 10.437 |
| 4.364 | 10.437 |
| 4.365 | 10.437 |
| 4.366 | 10.437 |
| 4.367 | 10.437 |
| 4.368 | 10.437 |
| 4.369 | 10.437 |
| 4.37 | 10.437 |
| 4.371 | 10.437 |
| 4.372 | 10.437 |
| 4.373 | 10.437 |
| 4.374 | 10.437 |
| 4.375 | 10.436 |
| 4.376 | 10.436 |
| 4.377 | 10.436 |
| 4.378 | 10.436 |
| 4.379 | 10.436 |
| 4.38 | 10.436 |
| 4.381 | 10.436 |
| 4.382 | 10.436 |
| 4.383 | 10.436 |
| 4.384 | 10.436 |
| 4.385 | 10.436 |
| 4.386 | 10.436 |
| 4.387 | 10.436 |
| 4.388 | 10.436 |
| 4.389 | 10.436 |
| 4.39 | 10.436 |
| 4.391 | 10.436 |
| 4.392 | 10.436 |
| 4.393 | 10.435 |
| 4.394 | 10.435 |
| 4.395 | 10.435 |
| 4.396 | 10.435 |
| 4.397 | 10.435 |
| 4.398 | 10.435 |
| 4.399 | 10.435 |
| 4.4 | 10.435 |
| 4.401 | 10.435 |
| 4.402 | 10.435 |
| 4.403 | 10.435 |
| 4.404 | 10.435 |
| 4.405 | 10.435 |
| 4.406 | 10.435 |
| 4.407 | 10.435 |
| 4.408 | 10.435 |
| 4.409 | 10.435 |
| 4.41 | 10.435 |
| 4.411 | 10.435 |
| 4.412 | 10.434 |
| 4.413 | 10.434 |
| 4.414 | 10.434 |
| 4.415 | 10.434 |
| 4.416 | 10.434 |
| 4.417 | 10.434 |
| 4.418 | 10.434 |
| 4.419 | 10.434 |
| 4.42 | 10.434 |
| 4.421 | 10.434 |
| 4.422 | 10.434 |
| 4.423 | 10.434 |
| 4.424 | 10.434 |
| 4.425 | 10.434 |
| 4.426 | 10.434 |
| 4.427 | 10.434 |
| 4.428 | 10.434 |
| 4.429 | 10.434 |
| 4.43 | 10.434 |
| 4.431 | 10.433 |
| 4.432 | 10.433 |
| 4.433 | 10.433 |
| 4.434 | 10.433 |
| 4.435 | 10.433 |
| 4.436 | 10.433 |
| 4.437 | 10.433 |
| 4.438 | 10.433 |
| 4.439 | 10.433 |
| 4.44 | 10.433 |
| 4.441 | 10.433 |
| 4.442 | 10.433 |
| 4.443 | 10.433 |
| 4.444 | 10.433 |
| 4.445 | 10.433 |
| 4.446 | 10.433 |
| 4.447 | 10.433 |
| 4.448 | 10.433 |
| 4.449 | 10.432 |
| 4.45 | 10.432 |
| 4.451 | 10.432 |
| 4.452 | 10.432 |
| 4.453 | 10.432 |
| 4.454 | 10.432 |
| 4.455 | 10.432 |
| 4.456 | 10.432 |
| 4.457 | 10.432 |
| 4.458 | 10.432 |
| 4.459 | 10.432 |
| 4.46 | 10.432 |
| 4.461 | 10.432 |
| 4.462 | 10.432 |
| 4.463 | 10.432 |
| 4.464 | 10.432 |
| 4.465 | 10.432 |
| 4.466 | 10.432 |
| 4.467 | 10.432 |
| 4.468 | 10.431 |
| 4.469 | 10.431 |
| 4.47 | 10.431 |
| 4.471 | 10.431 |
| 4.472 | 10.431 |
| 4.473 | 10.431 |
| 4.474 | 10.431 |
| 4.475 | 10.431 |
| 4.476 | 10.431 |
| 4.477 | 10.431 |
| 4.478 | 10.431 |
| 4.479 | 10.431 |
| 4.48 | 10.431 |
| 4.481 | 10.431 |
| 4.482 | 10.431 |
| 4.483 | 10.431 |
| 4.484 | 10.431 |
| 4.485 | 10.431 |
| 4.486 | 10.43 |
| 4.487 | 10.43 |
| 4.488 | 10.43 |
| 4.489 | 10.43 |
| 4.49 | 10.43 |
| 4.491 | 10.43 |
| 4.492 | 10.43 |
| 4.493 | 10.43 |
| 4.494 | 10.43 |
| 4.495 | 10.43 |
| 4.496 | 10.43 |
| 4.497 | 10.43 |
| 4.498 | 10.43 |
| 4.499 | 10.43 |
| 4.5 | 10.43 |
| 4.501 | 10.43 |
| 4.502 | 10.43 |
| 4.503 | 10.43 |
| 4.504 | 10.43 |
| 4.505 | 10.429 |
| 4.506 | 10.429 |
| 4.507 | 10.429 |
| 4.508 | 10.429 |
| 4.509 | 10.429 |
| 4.51 | 10.429 |
| 4.511 | 10.429 |
| 4.512 | 10.429 |
| 4.513 | 10.429 |
| 4.514 | 10.429 |
| 4.515 | 10.429 |
| 4.516 | 10.429 |
| 4.517 | 10.429 |
| 4.518 | 10.429 |
| 4.519 | 10.429 |
| 4.52 | 10.429 |
| 4.521 | 10.429 |
| 4.522 | 10.429 |
| 4.523 | 10.428 |
| 4.524 | 10.428 |
| 4.525 | 10.428 |
| 4.526 | 10.428 |
| 4.527 | 10.428 |
| 4.528 | 10.428 |
| 4.529 | 10.428 |
| 4.53 | 10.428 |
| 4.531 | 10.428 |
| 4.532 | 10.428 |
| 4.533 | 10.428 |
| 4.534 | 10.428 |
| 4.535 | 10.428 |
| 4.536 | 10.428 |
| 4.537 | 10.428 |
| 4.538 | 10.428 |
| 4.539 | 10.428 |
| 4.54 | 10.428 |
| 4.541 | 10.428 |
| 4.542 | 10.427 |
| 4.543 | 10.427 |
| 4.544 | 10.427 |
| 4.545 | 10.427 |
| 4.546 | 10.427 |
| 4.547 | 10.427 |
| 4.548 | 10.427 |
| 4.549 | 10.427 |
| 4.55 | 10.427 |
| 4.551 | 10.427 |
| 4.552 | 10.427 |
| 4.553 | 10.427 |
| 4.554 | 10.427 |
| 4.555 | 10.427 |
| 4.556 | 10.427 |
| 4.557 | 10.427 |
| 4.558 | 10.427 |
| 4.559 | 10.427 |
| 4.56 | 10.426 |
| 4.561 | 10.426 |
| 4.562 | 10.426 |
| 4.563 | 10.426 |
| 4.564 | 10.426 |
| 4.565 | 10.426 |
| 4.566 | 10.426 |
| 4.567 | 10.426 |
| 4.568 | 10.426 |
| 4.569 | 10.426 |
| 4.57 | 10.426 |
| 4.571 | 10.426 |
| 4.572 | 10.426 |
| 4.573 | 10.426 |
| 4.574 | 10.426 |
| 4.575 | 10.426 |
| 4.576 | 10.426 |
| 4.577 | 10.426 |
| 4.578 | 10.426 |
| 4.579 | 10.425 |
| 4.58 | 10.425 |
| 4.581 | 10.425 |
| 4.582 | 10.425 |
| 4.583 | 10.425 |
| 4.584 | 10.425 |
| 4.585 | 10.425 |
| 4.586 | 10.425 |
| 4.587 | 10.425 |
| 4.588 | 10.425 |
| 4.589 | 10.425 |
| 4.59 | 10.425 |
| 4.591 | 10.425 |
| 4.592 | 10.425 |
| 4.593 | 10.425 |
| 4.594 | 10.425 |
| 4.595 | 10.425 |
| 4.596 | 10.425 |
| 4.597 | 10.424 |
| 4.598 | 10.424 |
| 4.599 | 10.424 |
| 4.6 | 10.424 |
| 4.601 | 10.424 |
| 4.602 | 10.424 |
| 4.603 | 10.424 |
| 4.604 | 10.424 |
| 4.605 | 10.424 |
| 4.606 | 10.424 |
| 4.607 | 10.424 |
| 4.608 | 10.424 |
| 4.609 | 10.424 |
| 4.61 | 10.424 |
| 4.611 | 10.424 |
| 4.612 | 10.424 |
| 4.613 | 10.424 |
| 4.614 | 10.424 |
| 4.615 | 10.424 |
| 4.616 | 10.423 |
| 4.617 | 10.423 |
| 4.618 | 10.423 |
| 4.619 | 10.423 |
| 4.62 | 10.423 |
| 4.621 | 10.423 |
| 4.622 | 10.423 |
| 4.623 | 10.423 |
| 4.624 | 10.423 |
| 4.625 | 10.423 |
| 4.626 | 10.423 |
| 4.627 | 10.423 |
| 4.628 | 10.423 |
| 4.629 | 10.423 |
| 4.63 | 10.423 |
| 4.631 | 10.423 |
| 4.632 | 10.423 |
| 4.633 | 10.423 |
| 4.634 | 10.422 |
| 4.635 | 10.422 |
| 4.636 | 10.422 |
| 4.637 | 10.422 |
| 4.638 | 10.422 |
| 4.639 | 10.422 |
| 4.64 | 10.422 |
| 4.641 | 10.422 |
| 4.642 | 10.422 |
| 4.643 | 10.422 |
| 4.644 | 10.422 |
| 4.645 | 10.422 |
| 4.646 | 10.422 |
| 4.647 | 10.422 |
| 4.648 | 10.422 |
| 4.649 | 10.422 |
| 4.65 | 10.422 |
| 4.651 | 10.422 |
| 4.652 | 10.421 |
| 4.653 | 10.421 |
| 4.654 | 10.421 |
| 4.655 | 10.421 |
| 4.656 | 10.421 |
| 4.657 | 10.421 |
| 4.658 | 10.421 |
| 4.659 | 10.421 |
| 4.66 | 10.421 |
| 4.661 | 10.421 |
| 4.662 | 10.421 |
| 4.663 | 10.421 |
| 4.664 | 10.421 |
| 4.665 | 10.421 |
| 4.666 | 10.421 |
| 4.667 | 10.421 |
| 4.668 | 10.421 |
| 4.669 | 10.421 |
| 4.67 | 10.42 |
| 4.671 | 10.42 |
| 4.672 | 10.42 |
| 4.673 | 10.42 |
| 4.674 | 10.42 |
| 4.675 | 10.42 |
| 4.676 | 10.42 |
| 4.677 | 10.42 |
| 4.678 | 10.42 |
| 4.679 | 10.42 |
| 4.68 | 10.42 |
| 4.681 | 10.42 |
| 4.682 | 10.42 |
| 4.683 | 10.42 |
| 4.684 | 10.42 |
| 4.685 | 10.42 |
| 4.686 | 10.42 |
| 4.687 | 10.42 |
| 4.688 | 10.42 |
| 4.689 | 10.419 |
| 4.69 | 10.419 |
| 4.691 | 10.419 |
| 4.692 | 10.419 |
| 4.693 | 10.419 |
| 4.694 | 10.419 |
| 4.695 | 10.419 |
| 4.696 | 10.419 |
| 4.697 | 10.419 |
| 4.698 | 10.419 |
| 4.699 | 10.419 |
| 4.7 | 10.419 |
| 4.701 | 10.419 |
| 4.702 | 10.419 |
| 4.703 | 10.419 |
| 4.704 | 10.419 |
| 4.705 | 10.419 |
| 4.706 | 10.419 |
| 4.707 | 10.418 |
| 4.708 | 10.418 |
| 4.709 | 10.418 |
| 4.71 | 10.418 |
| 4.711 | 10.418 |
| 4.712 | 10.418 |
| 4.713 | 10.418 |
| 4.714 | 10.418 |
| 4.715 | 10.418 |
| 4.716 | 10.418 |
| 4.717 | 10.418 |
| 4.718 | 10.418 |
| 4.719 | 10.418 |
| 4.72 | 10.418 |
| 4.721 | 10.418 |
| 4.722 | 10.418 |
| 4.723 | 10.418 |
| 4.724 | 10.418 |
| 4.725 | 10.417 |
| 4.726 | 10.417 |
| 4.727 | 10.417 |
| 4.728 | 10.417 |
| 4.729 | 10.417 |
| 4.73 | 10.417 |
| 4.731 | 10.417 |
| 4.732 | 10.417 |
| 4.733 | 10.417 |
| 4.734 | 10.417 |
| 4.735 | 10.417 |
| 4.736 | 10.417 |
| 4.737 | 10.417 |
| 4.738 | 10.417 |
| 4.739 | 10.417 |
| 4.74 | 10.417 |
| 4.741 | 10.417 |
| 4.742 | 10.417 |
| 4.743 | 10.416 |
| 4.744 | 10.416 |
| 4.745 | 10.416 |
| 4.746 | 10.416 |
| 4.747 | 10.416 |
| 4.748 | 10.416 |
| 4.749 | 10.416 |
| 4.75 | 10.416 |
| 4.751 | 10.416 |
| 4.752 | 10.416 |
| 4.753 | 10.416 |
| 4.754 | 10.416 |
| 4.755 | 10.416 |
| 4.756 | 10.416 |
| 4.757 | 10.416 |
| 4.758 | 10.416 |
| 4.759 | 10.416 |
| 4.76 | 10.416 |
| 4.761 | 10.416 |
| 4.762 | 10.415 |
| 4.763 | 10.415 |
| 4.764 | 10.415 |
| 4.765 | 10.415 |
| 4.766 | 10.415 |
| 4.767 | 10.415 |
| 4.768 | 10.415 |
| 4.769 | 10.415 |
| 4.77 | 10.415 |
| 4.771 | 10.415 |
| 4.772 | 10.415 |
| 4.773 | 10.415 |
| 4.774 | 10.415 |
| 4.775 | 10.415 |
| 4.776 | 10.415 |
| 4.777 | 10.415 |
| 4.778 | 10.415 |
| 4.779 | 10.415 |
| 4.78 | 10.414 |
| 4.781 | 10.414 |
| 4.782 | 10.414 |
| 4.783 | 10.414 |
| 4.784 | 10.414 |
| 4.785 | 10.414 |
| 4.786 | 10.414 |
| 4.787 | 10.414 |
| 4.788 | 10.414 |
| 4.789 | 10.414 |
| 4.79 | 10.414 |
| 4.791 | 10.414 |
| 4.792 | 10.414 |
| 4.793 | 10.414 |
| 4.794 | 10.414 |
| 4.795 | 10.414 |
| 4.796 | 10.414 |
| 4.797 | 10.414 |
| 4.798 | 10.413 |
| 4.799 | 10.413 |
| 4.8 | 10.413 |
| 4.801 | 10.413 |
| 4.802 | 10.413 |
| 4.803 | 10.413 |
| 4.804 | 10.413 |
| 4.805 | 10.413 |
| 4.806 | 10.413 |
| 4.807 | 10.413 |
| 4.808 | 10.413 |
| 4.809 | 10.413 |
| 4.81 | 10.413 |
| 4.811 | 10.413 |
| 4.812 | 10.413 |
| 4.813 | 10.413 |
| 4.814 | 10.413 |
| 4.815 | 10.413 |
| 4.816 | 10.412 |
| 4.817 | 10.412 |
| 4.818 | 10.412 |
| 4.819 | 10.412 |
| 4.82 | 10.412 |
| 4.821 | 10.412 |
| 4.822 | 10.412 |
| 4.823 | 10.412 |
| 4.824 | 10.412 |
| 4.825 | 10.412 |
| 4.826 | 10.412 |
| 4.827 | 10.412 |
| 4.828 | 10.412 |
| 4.829 | 10.412 |
| 4.83 | 10.412 |
| 4.831 | 10.412 |
| 4.832 | 10.412 |
| 4.833 | 10.412 |
| 4.834 | 10.411 |
| 4.835 | 10.411 |
| 4.836 | 10.411 |
| 4.837 | 10.411 |
| 4.838 | 10.411 |
| 4.839 | 10.411 |
| 4.84 | 10.411 |
| 4.841 | 10.411 |
| 4.842 | 10.411 |
| 4.843 | 10.411 |
| 4.844 | 10.411 |
| 4.845 | 10.411 |
| 4.846 | 10.411 |
| 4.847 | 10.411 |
| 4.848 | 10.411 |
| 4.849 | 10.411 |
| 4.85 | 10.411 |
| 4.851 | 10.411 |
| 4.852 | 10.41 |
| 4.853 | 10.41 |
| 4.854 | 10.41 |
| 4.855 | 10.41 |
| 4.856 | 10.41 |
| 4.857 | 10.41 |
| 4.858 | 10.41 |
| 4.859 | 10.41 |
| 4.86 | 10.41 |
| 4.861 | 10.41 |
| 4.862 | 10.41 |
| 4.863 | 10.41 |
| 4.864 | 10.41 |
| 4.865 | 10.41 |
| 4.866 | 10.41 |
| 4.867 | 10.41 |
| 4.868 | 10.41 |
| 4.869 | 10.41 |
| 4.87 | 10.409 |
| 4.871 | 10.409 |
| 4.872 | 10.409 |
| 4.873 | 10.409 |
| 4.874 | 10.409 |
| 4.875 | 10.409 |
| 4.876 | 10.409 |
| 4.877 | 10.409 |
| 4.878 | 10.409 |
| 4.879 | 10.409 |
| 4.88 | 10.409 |
| 4.881 | 10.409 |
| 4.882 | 10.409 |
| 4.883 | 10.409 |
| 4.884 | 10.409 |
| 4.885 | 10.409 |
| 4.886 | 10.409 |
| 4.887 | 10.409 |
| 4.888 | 10.408 |
| 4.889 | 10.408 |
| 4.89 | 10.408 |
| 4.891 | 10.408 |
| 4.892 | 10.408 |
| 4.893 | 10.408 |
| 4.894 | 10.408 |
| 4.895 | 10.408 |
| 4.896 | 10.408 |
| 4.897 | 10.408 |
| 4.898 | 10.408 |
| 4.899 | 10.408 |
| 4.9 | 10.408 |
| 4.901 | 10.408 |
| 4.902 | 10.408 |
| 4.903 | 10.408 |
| 4.904 | 10.408 |
| 4.905 | 10.408 |
| 4.906 | 10.407 |
| 4.907 | 10.407 |
| 4.908 | 10.407 |
| 4.909 | 10.407 |
| 4.91 | 10.407 |
| 4.911 | 10.407 |
| 4.912 | 10.407 |
| 4.913 | 10.407 |
| 4.914 | 10.407 |
| 4.915 | 10.407 |
| 4.916 | 10.407 |
| 4.917 | 10.407 |
| 4.918 | 10.407 |
| 4.919 | 10.407 |
| 4.92 | 10.407 |
| 4.921 | 10.407 |
| 4.922 | 10.407 |
| 4.923 | 10.406 |
| 4.924 | 10.406 |
| 4.925 | 10.406 |
| 4.926 | 10.406 |
| 4.927 | 10.406 |
| 4.928 | 10.406 |
| 4.929 | 10.406 |
| 4.93 | 10.406 |
| 4.931 | 10.406 |
| 4.932 | 10.406 |
| 4.933 | 10.406 |
| 4.934 | 10.406 |
| 4.935 | 10.406 |
| 4.936 | 10.406 |
| 4.937 | 10.406 |
| 4.938 | 10.406 |
| 4.939 | 10.406 |
| 4.94 | 10.406 |
| 4.941 | 10.405 |
| 4.942 | 10.405 |
| 4.943 | 10.405 |
| 4.944 | 10.405 |
| 4.945 | 10.405 |
| 4.946 | 10.405 |
| 4.947 | 10.405 |
| 4.948 | 10.405 |
| 4.949 | 10.405 |
| 4.95 | 10.405 |
| 4.951 | 10.405 |
| 4.952 | 10.405 |
| 4.953 | 10.405 |
| 4.954 | 10.405 |
| 4.955 | 10.405 |
| 4.956 | 10.405 |
| 4.957 | 10.405 |
| 4.958 | 10.405 |
| 4.959 | 10.404 |
| 4.96 | 10.404 |
| 4.961 | 10.404 |
| 4.962 | 10.404 |
| 4.963 | 10.404 |
| 4.964 | 10.404 |
| 4.965 | 10.404 |
| 4.966 | 10.404 |
| 4.967 | 10.404 |
| 4.968 | 10.404 |
| 4.969 | 10.404 |
| 4.97 | 10.404 |
| 4.971 | 10.404 |
| 4.972 | 10.404 |
| 4.973 | 10.404 |
| 4.974 | 10.404 |
| 4.975 | 10.404 |
| 4.976 | 10.404 |
| 4.977 | 10.403 |
| 4.978 | 10.403 |
| 4.979 | 10.403 |
| 4.98 | 10.403 |
| 4.981 | 10.403 |
| 4.982 | 10.403 |
| 4.983 | 10.403 |
| 4.984 | 10.403 |
| 4.985 | 10.403 |
| 4.986 | 10.403 |
| 4.987 | 10.403 |
| 4.988 | 10.403 |
| 4.989 | 10.403 |
| 4.99 | 10.403 |
| 4.991 | 10.403 |
| 4.992 | 10.403 |
| 4.993 | 10.403 |
| 4.994 | 10.403 |
| 4.995 | 10.402 |
| 4.996 | 10.402 |
| 4.997 | 10.402 |
| 4.998 | 10.402 |
| 4.999 | 10.402 |
| 5.0 | 10.402 |